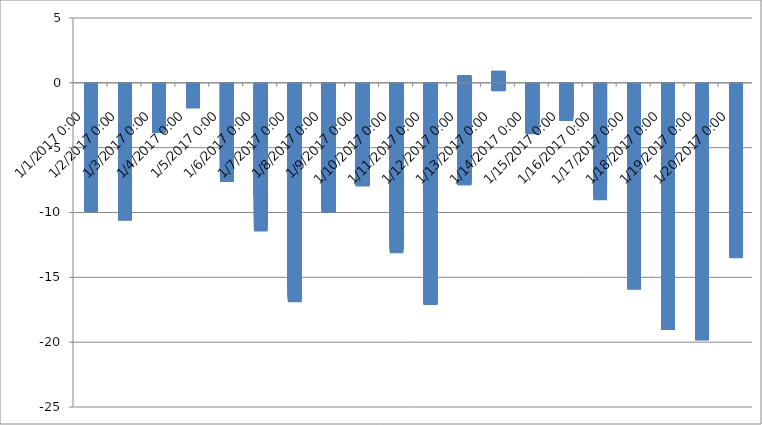
| Category | Series 0 |
|---|---|
| 2017-01-20 14:05:00 | -2.94 |
| 2017-01-20 13:55:00 | -3.04 |
| 2017-01-20 13:45:00 | -3.27 |
| 2017-01-20 13:35:01 | -3.48 |
| 2017-01-20 13:25:00 | -3.65 |
| 2017-01-20 13:15:00 | -3.69 |
| 2017-01-20 13:05:00 | -3.88 |
| 2017-01-20 12:55:01 | -4.12 |
| 2017-01-20 12:45:00 | -4.33 |
| 2017-01-20 12:35:00 | -4.58 |
| 2017-01-20 12:25:00 | -4.79 |
| 2017-01-20 12:15:00 | -4.99 |
| 2017-01-20 12:05:00 | -5.22 |
| 2017-01-20 11:55:00 | -5.56 |
| 2017-01-20 11:45:00 | -5.78 |
| 2017-01-20 11:35:00 | -6.12 |
| 2017-01-20 11:25:01 | -6.4 |
| 2017-01-20 11:15:00 | -6.59 |
| 2017-01-20 11:05:00 | -6.93 |
| 2017-01-20 10:55:00 | -7.17 |
| 2017-01-20 10:45:01 | -7.41 |
| 2017-01-20 10:35:00 | -7.7 |
| 2017-01-20 10:25:00 | -7.82 |
| 2017-01-20 10:15:00 | -8.14 |
| 2017-01-20 10:05:00 | -8.28 |
| 2017-01-20 09:55:00 | -8.5 |
| 2017-01-20 09:45:00 | -8.76 |
| 2017-01-20 09:35:00 | -9.01 |
| 2017-01-20 09:25:00 | -9.4 |
| 2017-01-20 09:15:01 | -9.62 |
| 2017-01-20 09:05:00 | -9.91 |
| 2017-01-20 08:55:00 | -10.06 |
| 2017-01-20 08:45:00 | -10.09 |
| 2017-01-20 08:35:01 | -10.04 |
| 2017-01-20 08:25:00 | -9.92 |
| 2017-01-20 08:15:00 | -9.8 |
| 2017-01-20 08:05:00 | -9.81 |
| 2017-01-20 07:55:01 | -9.72 |
| 2017-01-20 07:45:00 | -9.74 |
| 2017-01-20 07:35:00 | -9.77 |
| 2017-01-20 07:25:00 | -9.8 |
| 2017-01-20 07:15:00 | -9.9 |
| 2017-01-20 07:05:01 | -9.96 |
| 2017-01-20 06:55:00 | -10.05 |
| 2017-01-20 06:45:00 | -10.08 |
| 2017-01-20 06:35:00 | -10.11 |
| 2017-01-20 06:25:01 | -10.19 |
| 2017-01-20 06:14:54 | -10.23 |
| 2017-01-20 06:04:54 | -10.38 |
| 2017-01-20 05:54:54 | -10.46 |
| 2017-01-20 05:44:55 | -10.52 |
| 2017-01-20 05:34:54 | -10.51 |
| 2017-01-20 05:24:54 | -10.59 |
| 2017-01-20 05:14:54 | -10.68 |
| 2017-01-20 05:04:54 | -10.69 |
| 2017-01-20 04:54:55 | -10.65 |
| 2017-01-20 04:44:54 | -10.82 |
| 2017-01-20 04:34:54 | -10.87 |
| 2017-01-20 04:24:54 | -10.97 |
| 2017-01-20 04:14:55 | -10.95 |
| 2017-01-20 04:04:54 | -11.1 |
| 2017-01-20 03:54:54 | -11.17 |
| 2017-01-20 03:44:54 | -11.18 |
| 2017-01-20 03:34:55 | -11.25 |
| 2017-01-20 03:24:54 | -11.35 |
| 2017-01-20 03:14:54 | -11.46 |
| 2017-01-20 03:04:54 | -11.49 |
| 2017-01-20 02:54:54 | -11.56 |
| 2017-01-20 02:44:55 | -11.66 |
| 2017-01-20 02:34:54 | -11.84 |
| 2017-01-20 02:24:54 | -11.9 |
| 2017-01-20 02:14:54 | -12.01 |
| 2017-01-20 02:04:55 | -12.11 |
| 2017-01-20 01:54:54 | -12.16 |
| 2017-01-20 01:44:54 | -12.28 |
| 2017-01-20 01:34:54 | -12.38 |
| 2017-01-20 01:24:55 | -12.56 |
| 2017-01-20 01:14:54 | -12.67 |
| 2017-01-20 01:04:54 | -12.79 |
| 2017-01-20 00:54:54 | -12.9 |
| 2017-01-20 00:44:54 | -12.94 |
| 2017-01-20 00:34:55 | -13.11 |
| 2017-01-20 00:24:54 | -13.19 |
| 2017-01-20 00:14:54 | -13.31 |
| 2017-01-20 00:04:54 | -13.46 |
| 2017-01-19 23:54:55 | -13.53 |
| 2017-01-19 23:44:54 | -13.71 |
| 2017-01-19 23:34:54 | -13.94 |
| 2017-01-19 23:24:54 | -14.14 |
| 2017-01-19 23:14:55 | -14.26 |
| 2017-01-19 23:04:54 | -14.4 |
| 2017-01-19 22:54:54 | -14.51 |
| 2017-01-19 22:44:54 | -14.63 |
| 2017-01-19 22:34:54 | -14.73 |
| 2017-01-19 22:24:55 | -14.83 |
| 2017-01-19 22:14:54 | -14.9 |
| 2017-01-19 22:04:54 | -14.98 |
| 2017-01-19 21:54:54 | -14.99 |
| 2017-01-19 21:44:55 | -14.93 |
| 2017-01-19 21:34:54 | -14.87 |
| 2017-01-19 21:24:54 | -14.83 |
| 2017-01-19 21:14:54 | -14.72 |
| 2017-01-19 21:04:54 | -14.68 |
| 2017-01-19 20:54:54 | -14.64 |
| 2017-01-19 20:44:54 | -14.53 |
| 2017-01-19 20:34:54 | -14.51 |
| 2017-01-19 20:24:54 | -14.4 |
| 2017-01-19 20:14:55 | -14.43 |
| 2017-01-19 20:04:54 | -14.37 |
| 2017-01-19 19:54:54 | -14.26 |
| 2017-01-19 19:44:54 | -14.26 |
| 2017-01-19 19:34:55 | -14.22 |
| 2017-01-19 19:24:54 | -14.13 |
| 2017-01-19 19:14:54 | -14.03 |
| 2017-01-19 19:04:54 | -13.9 |
| 2017-01-19 18:54:54 | -13.92 |
| 2017-01-19 18:44:55 | -13.92 |
| 2017-01-19 18:34:54 | -13.83 |
| 2017-01-19 18:24:54 | -13.71 |
| 2017-01-19 18:14:54 | -13.71 |
| 2017-01-19 18:04:55 | -13.61 |
| 2017-01-19 17:54:54 | -13.65 |
| 2017-01-19 17:44:54 | -13.54 |
| 2017-01-19 17:34:54 | -13.45 |
| 2017-01-19 17:24:55 | -13.4 |
| 2017-01-19 17:14:54 | -13.41 |
| 2017-01-19 17:04:54 | -13.33 |
| 2017-01-19 16:54:54 | -13.37 |
| 2017-01-19 16:44:54 | -13.23 |
| 2017-01-19 16:34:55 | -13.23 |
| 2017-01-19 16:24:54 | -13.18 |
| 2017-01-19 16:14:54 | -13.15 |
| 2017-01-19 16:04:54 | -13.12 |
| 2017-01-19 15:54:55 | -13.04 |
| 2017-01-19 15:44:54 | -13.04 |
| 2017-01-19 15:34:54 | -12.97 |
| 2017-01-19 15:24:54 | -13.06 |
| 2017-01-19 15:14:55 | -12.94 |
| 2017-01-19 15:04:54 | -12.97 |
| 2017-01-19 14:54:54 | -13.01 |
| 2017-01-19 14:44:54 | -13.04 |
| 2017-01-19 14:34:54 | -13.08 |
| 2017-01-19 14:24:55 | -13.17 |
| 2017-01-19 14:14:54 | -13.37 |
| 2017-01-19 14:04:54 | -13.54 |
| 2017-01-19 13:54:54 | -13.76 |
| 2017-01-19 13:44:55 | -13.95 |
| 2017-01-19 13:34:54 | -14.14 |
| 2017-01-19 13:24:54 | -14.29 |
| 2017-01-19 13:14:54 | -14.58 |
| 2017-01-19 13:04:55 | -14.83 |
| 2017-01-19 12:54:54 | -15.09 |
| 2017-01-19 12:44:54 | -15.29 |
| 2017-01-19 12:34:54 | -15.54 |
| 2017-01-19 12:24:54 | -15.81 |
| 2017-01-19 12:14:55 | -16.02 |
| 2017-01-19 12:04:54 | -16.37 |
| 2017-01-19 11:54:54 | -16.72 |
| 2017-01-19 11:44:54 | -16.97 |
| 2017-01-19 11:34:55 | -17.33 |
| 2017-01-19 11:24:54 | -17.6 |
| 2017-01-19 11:14:54 | -17.82 |
| 2017-01-19 11:04:54 | -18.08 |
| 2017-01-19 10:54:54 | -18.21 |
| 2017-01-19 10:44:54 | -18.42 |
| 2017-01-19 10:34:54 | -18.66 |
| 2017-01-19 10:24:54 | -18.86 |
| 2017-01-19 10:14:54 | -19.08 |
| 2017-01-19 10:04:55 | -19.24 |
| 2017-01-19 09:54:54 | -19.27 |
| 2017-01-19 09:44:54 | -19.39 |
| 2017-01-19 09:34:54 | -19.47 |
| 2017-01-19 09:24:55 | -19.56 |
| 2017-01-19 09:14:54 | -19.58 |
| 2017-01-19 09:04:54 | -19.7 |
| 2017-01-19 08:54:54 | -19.76 |
| 2017-01-19 08:44:54 | -19.77 |
| 2017-01-19 08:34:55 | -19.75 |
| 2017-01-19 08:24:54 | -19.73 |
| 2017-01-19 08:14:54 | -19.78 |
| 2017-01-19 08:04:54 | -19.78 |
| 2017-01-19 07:54:55 | -19.63 |
| 2017-01-19 07:44:54 | -19.69 |
| 2017-01-19 07:34:54 | -19.6 |
| 2017-01-19 07:24:54 | -19.56 |
| 2017-01-19 07:14:55 | -19.56 |
| 2017-01-19 07:04:54 | -19.45 |
| 2017-01-19 06:54:54 | -19.4 |
| 2017-01-19 06:44:54 | -19.31 |
| 2017-01-19 06:34:54 | -19.21 |
| 2017-01-19 06:24:55 | -19.25 |
| 2017-01-19 06:14:54 | -19.24 |
| 2017-01-19 06:04:54 | -19.21 |
| 2017-01-19 05:54:54 | -19.07 |
| 2017-01-19 05:44:55 | -19.1 |
| 2017-01-19 05:34:54 | -19.07 |
| 2017-01-19 05:24:54 | -18.93 |
| 2017-01-19 05:14:54 | -18.91 |
| 2017-01-19 05:04:55 | -18.86 |
| 2017-01-19 04:54:49 | -18.83 |
| 2017-01-19 04:44:49 | -18.76 |
| 2017-01-19 04:34:49 | -18.69 |
| 2017-01-19 04:24:49 | -18.59 |
| 2017-01-19 04:14:50 | -18.56 |
| 2017-01-19 04:04:49 | -18.5 |
| 2017-01-19 03:54:49 | -18.45 |
| 2017-01-19 03:44:49 | -18.41 |
| 2017-01-19 03:34:50 | -18.4 |
| 2017-01-19 03:24:49 | -18.29 |
| 2017-01-19 03:14:49 | -18.19 |
| 2017-01-19 03:04:49 | -18.14 |
| 2017-01-19 02:54:50 | -18.04 |
| 2017-01-19 02:44:49 | -17.98 |
| 2017-01-19 02:34:49 | -17.93 |
| 2017-01-19 02:24:49 | -17.9 |
| 2017-01-19 02:14:49 | -17.84 |
| 2017-01-19 02:04:50 | -17.71 |
| 2017-01-19 01:54:49 | -17.67 |
| 2017-01-19 01:44:49 | -17.55 |
| 2017-01-19 01:34:49 | -17.46 |
| 2017-01-19 01:24:50 | -17.46 |
| 2017-01-19 01:14:49 | -17.31 |
| 2017-01-19 01:04:49 | -17.31 |
| 2017-01-19 00:54:49 | -17.26 |
| 2017-01-19 00:44:50 | -17.1 |
| 2017-01-19 00:34:49 | -17.06 |
| 2017-01-19 00:24:49 | -16.97 |
| 2017-01-19 00:14:49 | -16.89 |
| 2017-01-19 00:04:49 | -16.79 |
| 2017-01-18 23:54:49 | -16.79 |
| 2017-01-18 23:44:49 | -16.65 |
| 2017-01-18 23:34:49 | -16.58 |
| 2017-01-18 23:24:49 | -16.52 |
| 2017-01-18 23:14:50 | -16.4 |
| 2017-01-18 23:04:49 | -16.36 |
| 2017-01-18 22:54:49 | -16.31 |
| 2017-01-18 22:44:49 | -16.19 |
| 2017-01-18 22:34:50 | -16.14 |
| 2017-01-18 22:24:49 | -16.15 |
| 2017-01-18 22:14:49 | -16.04 |
| 2017-01-18 22:04:49 | -16.01 |
| 2017-01-18 21:54:49 | -15.87 |
| 2017-01-18 21:44:50 | -15.83 |
| 2017-01-18 21:34:49 | -15.66 |
| 2017-01-18 21:24:49 | -15.55 |
| 2017-01-18 21:14:49 | -15.51 |
| 2017-01-18 21:04:50 | -15.38 |
| 2017-01-18 20:54:49 | -15.31 |
| 2017-01-18 20:44:49 | -15.19 |
| 2017-01-18 20:34:49 | -15.18 |
| 2017-01-18 20:24:50 | -15.03 |
| 2017-01-18 20:14:49 | -14.97 |
| 2017-01-18 20:04:49 | -14.84 |
| 2017-01-18 19:54:49 | -14.83 |
| 2017-01-18 19:44:49 | -14.68 |
| 2017-01-18 19:34:50 | -14.64 |
| 2017-01-18 19:24:49 | -14.48 |
| 2017-01-18 19:14:49 | -14.33 |
| 2017-01-18 19:04:49 | -14.28 |
| 2017-01-18 18:54:50 | -14.16 |
| 2017-01-18 18:44:49 | -14.09 |
| 2017-01-18 18:34:49 | -13.96 |
| 2017-01-18 18:24:49 | -13.83 |
| 2017-01-18 18:14:50 | -13.79 |
| 2017-01-18 18:04:49 | -13.77 |
| 2017-01-18 17:54:49 | -13.63 |
| 2017-01-18 17:44:49 | -13.59 |
| 2017-01-18 17:34:49 | -13.52 |
| 2017-01-18 17:24:50 | -13.37 |
| 2017-01-18 17:14:49 | -13.21 |
| 2017-01-18 17:04:49 | -13.21 |
| 2017-01-18 16:54:49 | -13.05 |
| 2017-01-18 16:44:50 | -13.04 |
| 2017-01-18 16:34:49 | -12.97 |
| 2017-01-18 16:24:49 | -12.93 |
| 2017-01-18 16:14:49 | -12.81 |
| 2017-01-18 16:04:49 | -12.74 |
| 2017-01-18 15:54:50 | -12.67 |
| 2017-01-18 15:44:49 | -12.53 |
| 2017-01-18 15:34:49 | -12.55 |
| 2017-01-18 15:24:49 | -12.46 |
| 2017-01-18 15:14:50 | -12.41 |
| 2017-01-18 15:04:49 | -12.41 |
| 2017-01-18 14:54:49 | -12.26 |
| 2017-01-18 14:44:49 | -12.29 |
| 2017-01-18 14:34:50 | -12.3 |
| 2017-01-18 14:24:49 | -12.28 |
| 2017-01-18 14:14:49 | -12.46 |
| 2017-01-18 14:04:49 | -12.64 |
| 2017-01-18 13:54:49 | -12.77 |
| 2017-01-18 13:44:50 | -13.03 |
| 2017-01-18 13:34:49 | -13.22 |
| 2017-01-18 13:24:49 | -13.45 |
| 2017-01-18 13:14:49 | -13.67 |
| 2017-01-18 13:04:50 | -13.94 |
| 2017-01-18 12:54:49 | -14.1 |
| 2017-01-18 12:44:49 | -14.41 |
| 2017-01-18 12:34:49 | -14.68 |
| 2017-01-18 12:24:50 | -14.98 |
| 2017-01-18 12:14:49 | -15.23 |
| 2017-01-18 12:04:49 | -15.59 |
| 2017-01-18 11:54:49 | -15.98 |
| 2017-01-18 11:44:49 | -16.17 |
| 2017-01-18 11:34:50 | -16.48 |
| 2017-01-18 11:24:49 | -16.76 |
| 2017-01-18 11:14:49 | -17.02 |
| 2017-01-18 11:04:49 | -17.29 |
| 2017-01-18 10:54:50 | -17.47 |
| 2017-01-18 10:44:49 | -17.59 |
| 2017-01-18 10:34:49 | -17.79 |
| 2017-01-18 10:24:49 | -18.05 |
| 2017-01-18 10:14:50 | -18.21 |
| 2017-01-18 10:04:49 | -18.36 |
| 2017-01-18 09:54:49 | -18.54 |
| 2017-01-18 09:44:49 | -18.74 |
| 2017-01-18 09:34:49 | -18.83 |
| 2017-01-18 09:24:50 | -18.95 |
| 2017-01-18 09:14:49 | -18.99 |
| 2017-01-18 09:04:49 | -18.98 |
| 2017-01-18 08:54:49 | -18.88 |
| 2017-01-18 08:44:50 | -18.88 |
| 2017-01-18 08:34:49 | -18.86 |
| 2017-01-18 08:24:49 | -18.96 |
| 2017-01-18 08:14:49 | -18.8 |
| 2017-01-18 08:04:49 | -18.88 |
| 2017-01-18 07:54:49 | -18.78 |
| 2017-01-18 07:44:49 | -18.74 |
| 2017-01-18 07:34:49 | -18.67 |
| 2017-01-18 07:24:49 | -18.56 |
| 2017-01-18 07:14:50 | -18.48 |
| 2017-01-18 07:04:49 | -18.4 |
| 2017-01-18 06:54:49 | -18.34 |
| 2017-01-18 06:44:49 | -18.23 |
| 2017-01-18 06:34:50 | -18.25 |
| 2017-01-18 06:24:49 | -18.14 |
| 2017-01-18 06:14:49 | -18.13 |
| 2017-01-18 06:04:49 | -17.98 |
| 2017-01-18 05:54:49 | -18.06 |
| 2017-01-18 05:44:50 | -17.95 |
| 2017-01-18 05:34:49 | -17.95 |
| 2017-01-18 05:24:49 | -17.85 |
| 2017-01-18 05:14:49 | -17.73 |
| 2017-01-18 05:04:50 | -17.71 |
| 2017-01-18 04:54:49 | -17.67 |
| 2017-01-18 04:44:49 | -17.51 |
| 2017-01-18 04:34:49 | -17.43 |
| 2017-01-18 04:24:50 | -17.41 |
| 2017-01-18 04:14:49 | -17.36 |
| 2017-01-18 04:04:49 | -17.32 |
| 2017-01-18 03:54:49 | -17.26 |
| 2017-01-18 03:44:49 | -17.21 |
| 2017-01-18 03:34:50 | -17.15 |
| 2017-01-18 03:24:49 | -17.11 |
| 2017-01-18 03:14:49 | -17.03 |
| 2017-01-18 03:04:49 | -16.91 |
| 2017-01-18 02:54:50 | -16.82 |
| 2017-01-18 02:44:49 | -16.73 |
| 2017-01-18 02:34:49 | -16.6 |
| 2017-01-18 02:24:49 | -16.58 |
| 2017-01-18 02:14:50 | -16.43 |
| 2017-01-18 02:04:49 | -16.4 |
| 2017-01-18 01:54:49 | -16.34 |
| 2017-01-18 01:44:49 | -16.18 |
| 2017-01-18 01:34:49 | -16.11 |
| 2017-01-18 01:24:50 | -16.15 |
| 2017-01-18 01:14:49 | -15.96 |
| 2017-01-18 01:04:49 | -15.82 |
| 2017-01-18 00:54:49 | -15.74 |
| 2017-01-18 00:44:50 | -15.61 |
| 2017-01-18 00:34:49 | -15.44 |
| 2017-01-18 00:24:49 | -15.34 |
| 2017-01-18 00:14:49 | -15.29 |
| 2017-01-18 00:04:50 | -15.16 |
| 2017-01-17 23:54:49 | -15.17 |
| 2017-01-17 23:44:49 | -15.09 |
| 2017-01-17 23:34:49 | -14.99 |
| 2017-01-17 23:24:49 | -14.87 |
| 2017-01-17 23:14:50 | -14.75 |
| 2017-01-17 23:04:49 | -14.6 |
| 2017-01-17 22:54:49 | -14.57 |
| 2017-01-17 22:44:49 | -14.44 |
| 2017-01-17 22:34:50 | -14.23 |
| 2017-01-17 22:24:49 | -14.16 |
| 2017-01-17 22:14:49 | -14.03 |
| 2017-01-17 22:04:41 | -13.94 |
| 2017-01-17 21:54:42 | -13.91 |
| 2017-01-17 21:44:41 | -13.79 |
| 2017-01-17 21:34:41 | -13.76 |
| 2017-01-17 21:24:41 | -13.69 |
| 2017-01-17 21:14:41 | -13.66 |
| 2017-01-17 21:04:42 | -13.53 |
| 2017-01-17 20:54:41 | -13.4 |
| 2017-01-17 20:44:41 | -13.29 |
| 2017-01-17 20:34:41 | -13.17 |
| 2017-01-17 20:24:42 | -13.06 |
| 2017-01-17 20:14:41 | -12.89 |
| 2017-01-17 20:04:41 | -12.86 |
| 2017-01-17 19:54:41 | -12.67 |
| 2017-01-17 19:44:42 | -12.58 |
| 2017-01-17 19:34:41 | -12.52 |
| 2017-01-17 19:24:41 | -12.34 |
| 2017-01-17 19:14:41 | -12.21 |
| 2017-01-17 19:04:41 | -12.11 |
| 2017-01-17 18:54:42 | -11.99 |
| 2017-01-17 18:44:41 | -11.92 |
| 2017-01-17 18:34:41 | -11.85 |
| 2017-01-17 18:24:41 | -11.66 |
| 2017-01-17 18:14:42 | -11.58 |
| 2017-01-17 18:04:41 | -11.55 |
| 2017-01-17 17:54:41 | -11.31 |
| 2017-01-17 17:44:41 | -11.26 |
| 2017-01-17 17:34:42 | -11.16 |
| 2017-01-17 17:24:41 | -11.1 |
| 2017-01-17 17:14:41 | -10.99 |
| 2017-01-17 17:04:41 | -10.9 |
| 2017-01-17 16:54:41 | -10.81 |
| 2017-01-17 16:44:42 | -10.87 |
| 2017-01-17 16:34:41 | -10.86 |
| 2017-01-17 16:24:41 | -10.83 |
| 2017-01-17 16:14:41 | -10.72 |
| 2017-01-17 16:04:42 | -10.63 |
| 2017-01-17 15:54:41 | -10.59 |
| 2017-01-17 15:44:41 | -10.65 |
| 2017-01-17 15:34:41 | -10.61 |
| 2017-01-17 15:24:42 | -10.55 |
| 2017-01-17 15:14:41 | -10.55 |
| 2017-01-17 15:04:41 | -10.55 |
| 2017-01-17 14:54:41 | -10.59 |
| 2017-01-17 14:44:41 | -10.49 |
| 2017-01-17 14:34:42 | -10.56 |
| 2017-01-17 14:24:41 | -10.63 |
| 2017-01-17 14:14:41 | -10.83 |
| 2017-01-17 14:04:41 | -10.96 |
| 2017-01-17 13:54:42 | -11.18 |
| 2017-01-17 13:44:41 | -11.34 |
| 2017-01-17 13:34:41 | -11.55 |
| 2017-01-17 13:24:41 | -11.63 |
| 2017-01-17 13:14:42 | -11.84 |
| 2017-01-17 13:04:41 | -12.04 |
| 2017-01-17 12:54:41 | -12.26 |
| 2017-01-17 12:44:41 | -12.37 |
| 2017-01-17 12:34:41 | -12.71 |
| 2017-01-17 12:24:42 | -12.93 |
| 2017-01-17 12:14:41 | -13.2 |
| 2017-01-17 12:04:41 | -13.51 |
| 2017-01-17 11:54:41 | -13.75 |
| 2017-01-17 11:44:42 | -14.06 |
| 2017-01-17 11:34:41 | -14.29 |
| 2017-01-17 11:24:41 | -14.59 |
| 2017-01-17 11:14:41 | -14.72 |
| 2017-01-17 11:04:42 | -14.89 |
| 2017-01-17 10:54:41 | -15.11 |
| 2017-01-17 10:44:41 | -15.3 |
| 2017-01-17 10:34:41 | -15.43 |
| 2017-01-17 10:24:41 | -15.51 |
| 2017-01-17 10:14:42 | -15.69 |
| 2017-01-17 10:04:41 | -15.78 |
| 2017-01-17 09:54:41 | -15.82 |
| 2017-01-17 09:44:41 | -15.87 |
| 2017-01-17 09:34:42 | -15.86 |
| 2017-01-17 09:24:41 | -15.85 |
| 2017-01-17 09:14:41 | -15.73 |
| 2017-01-17 09:04:41 | -15.27 |
| 2017-01-17 08:54:42 | -14.8 |
| 2017-01-17 08:44:41 | -15.06 |
| 2017-01-17 08:34:41 | -14.9 |
| 2017-01-17 08:24:41 | -14.67 |
| 2017-01-17 08:14:41 | -14.63 |
| 2017-01-17 08:04:42 | -14.66 |
| 2017-01-17 07:54:41 | -14.49 |
| 2017-01-17 07:44:41 | -14.54 |
| 2017-01-17 07:34:41 | -14.33 |
| 2017-01-17 07:24:42 | -14.09 |
| 2017-01-17 07:14:41 | -13.99 |
| 2017-01-17 07:04:41 | -13.93 |
| 2017-01-17 06:54:41 | -13.86 |
| 2017-01-17 06:44:42 | -13.66 |
| 2017-01-17 06:34:41 | -13.45 |
| 2017-01-17 06:24:41 | -13.53 |
| 2017-01-17 06:14:41 | -13.39 |
| 2017-01-17 06:04:41 | -13.24 |
| 2017-01-17 05:54:42 | -13.07 |
| 2017-01-17 05:44:41 | -12.89 |
| 2017-01-17 05:34:41 | -12.92 |
| 2017-01-17 05:24:41 | -12.76 |
| 2017-01-17 05:14:42 | -12.41 |
| 2017-01-17 05:04:41 | -12.4 |
| 2017-01-17 04:54:41 | -12.4 |
| 2017-01-17 04:44:41 | -12.29 |
| 2017-01-17 04:34:41 | -12.21 |
| 2017-01-17 04:24:41 | -11.99 |
| 2017-01-17 04:14:41 | -11.91 |
| 2017-01-17 04:04:41 | -11.74 |
| 2017-01-17 03:54:41 | -11.73 |
| 2017-01-17 03:44:42 | -11.68 |
| 2017-01-17 03:34:41 | -11.46 |
| 2017-01-17 03:24:41 | -11.31 |
| 2017-01-17 03:14:41 | -11.2 |
| 2017-01-17 03:04:42 | -11.13 |
| 2017-01-17 02:54:41 | -10.97 |
| 2017-01-17 02:44:41 | -10.82 |
| 2017-01-17 02:34:41 | -10.73 |
| 2017-01-17 02:24:42 | -10.58 |
| 2017-01-17 02:14:41 | -10.49 |
| 2017-01-17 02:04:41 | -10.48 |
| 2017-01-17 01:54:41 | -10.21 |
| 2017-01-17 01:44:41 | -10.14 |
| 2017-01-17 01:34:42 | -9.96 |
| 2017-01-17 01:24:41 | -9.87 |
| 2017-01-17 01:14:41 | -9.84 |
| 2017-01-17 01:04:41 | -9.64 |
| 2017-01-17 00:54:42 | -9.6 |
| 2017-01-17 00:44:41 | -9.52 |
| 2017-01-17 00:34:41 | -9.48 |
| 2017-01-17 00:24:41 | -9.34 |
| 2017-01-17 00:14:41 | -9.15 |
| 2017-01-17 00:04:41 | -9.09 |
| 2017-01-16 23:54:41 | -8.97 |
| 2017-01-16 23:44:41 | -8.87 |
| 2017-01-16 23:34:41 | -8.73 |
| 2017-01-16 23:24:42 | -8.64 |
| 2017-01-16 23:14:41 | -8.51 |
| 2017-01-16 23:04:41 | -8.38 |
| 2017-01-16 22:54:41 | -8.26 |
| 2017-01-16 22:44:42 | -8.14 |
| 2017-01-16 22:34:41 | -8.05 |
| 2017-01-16 22:24:41 | -7.78 |
| 2017-01-16 22:14:41 | -7.63 |
| 2017-01-16 22:04:41 | -7.5 |
| 2017-01-16 21:54:42 | -7.33 |
| 2017-01-16 21:44:41 | -7.06 |
| 2017-01-16 21:34:41 | -6.79 |
| 2017-01-16 21:24:41 | -6.54 |
| 2017-01-16 21:14:42 | -6.35 |
| 2017-01-16 21:04:41 | -6.14 |
| 2017-01-16 20:54:41 | -5.8 |
| 2017-01-16 20:44:41 | -5.61 |
| 2017-01-16 20:34:42 | -5.3 |
| 2017-01-16 20:24:41 | -5.1 |
| 2017-01-16 20:14:41 | -5.01 |
| 2017-01-16 20:04:41 | -4.86 |
| 2017-01-16 19:54:41 | -4.62 |
| 2017-01-16 19:44:42 | -4.49 |
| 2017-01-16 19:34:41 | -4.02 |
| 2017-01-16 19:24:41 | -3.77 |
| 2017-01-16 19:14:41 | -3.6 |
| 2017-01-16 19:04:42 | -3.54 |
| 2017-01-16 18:54:41 | -3.4 |
| 2017-01-16 18:44:41 | -3.15 |
| 2017-01-16 18:34:41 | -2.95 |
| 2017-01-16 18:24:42 | -2.84 |
| 2017-01-16 18:14:41 | -2.74 |
| 2017-01-16 18:04:42 | -2.65 |
| 2017-01-16 17:54:42 | -2.53 |
| 2017-01-16 17:44:42 | -2.43 |
| 2017-01-16 17:34:43 | -2.28 |
| 2017-01-16 17:24:42 | -2.12 |
| 2017-01-16 17:14:42 | -2.16 |
| 2017-01-16 17:04:42 | -2.11 |
| 2017-01-16 16:54:43 | -2.03 |
| 2017-01-16 16:44:42 | -1.87 |
| 2017-01-16 16:34:42 | -1.86 |
| 2017-01-16 16:24:42 | -1.65 |
| 2017-01-16 16:14:42 | -1.63 |
| 2017-01-16 16:04:42 | -1.43 |
| 2017-01-16 15:54:42 | -1.36 |
| 2017-01-16 15:44:42 | -1.29 |
| 2017-01-16 15:34:42 | -1.25 |
| 2017-01-16 15:24:43 | -1.13 |
| 2017-01-16 15:14:42 | -1.1 |
| 2017-01-16 15:04:42 | -1.09 |
| 2017-01-16 14:54:42 | -1.19 |
| 2017-01-16 14:44:43 | -1.09 |
| 2017-01-16 14:34:42 | -1.09 |
| 2017-01-16 14:24:42 | -1.09 |
| 2017-01-16 14:14:42 | -1.19 |
| 2017-01-16 14:04:43 | -1.21 |
| 2017-01-16 13:54:42 | -1.33 |
| 2017-01-16 13:44:42 | -1.41 |
| 2017-01-16 13:34:42 | -1.4 |
| 2017-01-16 13:24:42 | -1.53 |
| 2017-01-16 13:14:43 | -1.48 |
| 2017-01-16 13:04:42 | -1.44 |
| 2017-01-16 12:54:42 | -1.35 |
| 2017-01-16 12:44:42 | -1.36 |
| 2017-01-16 12:34:43 | -1.4 |
| 2017-01-16 12:24:42 | -1.58 |
| 2017-01-16 12:14:42 | -1.87 |
| 2017-01-16 12:04:42 | -2.21 |
| 2017-01-16 11:54:43 | -2.34 |
| 2017-01-16 11:44:42 | -2.43 |
| 2017-01-16 11:34:42 | -2.7 |
| 2017-01-16 11:24:42 | -2.81 |
| 2017-01-16 11:14:42 | -2.88 |
| 2017-01-16 11:04:43 | -3.05 |
| 2017-01-16 10:54:42 | -3.14 |
| 2017-01-16 10:44:42 | -3.09 |
| 2017-01-16 10:34:42 | -3.23 |
| 2017-01-16 10:24:43 | -3.4 |
| 2017-01-16 10:14:42 | -3.56 |
| 2017-01-16 10:04:42 | -3.7 |
| 2017-01-16 09:54:42 | -3.56 |
| 2017-01-16 09:44:42 | -3.64 |
| 2017-01-16 09:34:43 | -3.71 |
| 2017-01-16 09:24:42 | -3.83 |
| 2017-01-16 09:14:42 | -3.98 |
| 2017-01-16 09:04:42 | -3.89 |
| 2017-01-16 08:54:43 | -4.04 |
| 2017-01-16 08:44:42 | -4.12 |
| 2017-01-16 08:34:42 | -4.25 |
| 2017-01-16 08:24:42 | -4.28 |
| 2017-01-16 08:14:43 | -4.3 |
| 2017-01-16 08:04:42 | -4.33 |
| 2017-01-16 07:54:42 | -4.37 |
| 2017-01-16 07:44:42 | -4.51 |
| 2017-01-16 07:34:42 | -4.44 |
| 2017-01-16 07:24:42 | -4.6 |
| 2017-01-16 07:14:42 | -4.56 |
| 2017-01-16 07:04:42 | -4.57 |
| 2017-01-16 06:54:42 | -4.51 |
| 2017-01-16 06:44:43 | -4.45 |
| 2017-01-16 06:34:42 | -4.42 |
| 2017-01-16 06:24:42 | -4.58 |
| 2017-01-16 06:14:42 | -4.58 |
| 2017-01-16 06:04:43 | -4.66 |
| 2017-01-16 05:54:42 | -4.46 |
| 2017-01-16 05:44:42 | -4.19 |
| 2017-01-16 05:34:42 | -3.94 |
| 2017-01-16 05:24:43 | -3.68 |
| 2017-01-16 05:14:42 | -3.46 |
| 2017-01-16 05:04:42 | -3.32 |
| 2017-01-16 04:54:42 | -3.24 |
| 2017-01-16 04:44:42 | -3.2 |
| 2017-01-16 04:34:43 | -3.18 |
| 2017-01-16 04:24:42 | -3.1 |
| 2017-01-16 04:14:42 | -3.09 |
| 2017-01-16 04:04:42 | -3.08 |
| 2017-01-16 03:54:43 | -3.08 |
| 2017-01-16 03:44:42 | -3.09 |
| 2017-01-16 03:34:42 | -3.11 |
| 2017-01-16 03:24:42 | -3.09 |
| 2017-01-16 03:14:42 | -3.14 |
| 2017-01-16 03:04:43 | -3.19 |
| 2017-01-16 02:54:42 | -3.21 |
| 2017-01-16 02:44:42 | -3.13 |
| 2017-01-16 02:34:42 | -3.11 |
| 2017-01-16 02:24:43 | -2.98 |
| 2017-01-16 02:14:42 | -3.08 |
| 2017-01-16 02:04:42 | -2.94 |
| 2017-01-16 01:54:42 | -3.05 |
| 2017-01-16 01:44:43 | -3.13 |
| 2017-01-16 01:34:42 | -3.01 |
| 2017-01-16 01:24:42 | -2.96 |
| 2017-01-16 01:14:42 | -2.84 |
| 2017-01-16 01:04:42 | -2.94 |
| 2017-01-16 00:54:43 | -2.84 |
| 2017-01-16 00:44:42 | -2.86 |
| 2017-01-16 00:34:42 | -2.89 |
| 2017-01-16 00:24:42 | -2.86 |
| 2017-01-16 00:14:43 | -2.9 |
| 2017-01-16 00:04:42 | -2.83 |
| 2017-01-15 23:54:42 | -2.84 |
| 2017-01-15 23:44:42 | -2.82 |
| 2017-01-15 23:34:43 | -2.77 |
| 2017-01-15 23:24:42 | -2.85 |
| 2017-01-15 23:14:42 | -2.83 |
| 2017-01-15 23:04:42 | -2.82 |
| 2017-01-15 22:54:42 | -2.79 |
| 2017-01-15 22:44:43 | -2.72 |
| 2017-01-15 22:34:42 | -2.72 |
| 2017-01-15 22:24:42 | -2.67 |
| 2017-01-15 22:14:42 | -2.65 |
| 2017-01-15 22:04:43 | -2.58 |
| 2017-01-15 21:54:42 | -2.57 |
| 2017-01-15 21:44:42 | -2.6 |
| 2017-01-15 21:34:42 | -2.64 |
| 2017-01-15 21:24:43 | -2.59 |
| 2017-01-15 21:14:42 | -2.56 |
| 2017-01-15 21:04:42 | -2.51 |
| 2017-01-15 20:54:42 | -2.49 |
| 2017-01-15 20:44:42 | -2.47 |
| 2017-01-15 20:34:43 | -2.45 |
| 2017-01-15 20:24:42 | -2.45 |
| 2017-01-15 20:14:42 | -2.44 |
| 2017-01-15 20:04:42 | -2.39 |
| 2017-01-15 19:54:43 | -2.41 |
| 2017-01-15 19:44:42 | -2.41 |
| 2017-01-15 19:34:42 | -2.36 |
| 2017-01-15 19:24:42 | -2.25 |
| 2017-01-15 19:14:43 | -2.28 |
| 2017-01-15 19:04:42 | -2.24 |
| 2017-01-15 18:54:42 | -2.29 |
| 2017-01-15 18:44:42 | -2.21 |
| 2017-01-15 18:34:42 | -2.13 |
| 2017-01-15 18:24:43 | -2.12 |
| 2017-01-15 18:14:42 | -2.15 |
| 2017-01-15 18:04:42 | -2.12 |
| 2017-01-15 17:54:42 | -2.09 |
| 2017-01-15 17:44:43 | -2.05 |
| 2017-01-15 17:34:42 | -2.08 |
| 2017-01-15 17:24:42 | -2.03 |
| 2017-01-15 17:14:42 | -2.01 |
| 2017-01-15 17:04:43 | -1.97 |
| 2017-01-15 16:54:42 | -1.95 |
| 2017-01-15 16:44:42 | -1.97 |
| 2017-01-15 16:34:42 | -1.86 |
| 2017-01-15 16:24:42 | -1.87 |
| 2017-01-15 16:14:42 | -1.77 |
| 2017-01-15 16:04:42 | -1.73 |
| 2017-01-15 15:54:42 | -1.72 |
| 2017-01-15 15:44:42 | -1.72 |
| 2017-01-15 15:34:43 | -1.72 |
| 2017-01-15 15:24:42 | -1.69 |
| 2017-01-15 15:14:42 | -1.62 |
| 2017-01-15 15:04:42 | -1.62 |
| 2017-01-15 14:54:43 | -1.69 |
| 2017-01-15 14:44:42 | -1.63 |
| 2017-01-15 14:34:42 | -1.66 |
| 2017-01-15 14:24:42 | -1.62 |
| 2017-01-15 14:14:43 | -1.48 |
| 2017-01-15 14:04:42 | -1.52 |
| 2017-01-15 13:54:42 | -1.48 |
| 2017-01-15 13:44:42 | -1.48 |
| 2017-01-15 13:34:42 | -1.42 |
| 2017-01-15 13:24:43 | -1.35 |
| 2017-01-15 13:14:42 | -1.32 |
| 2017-01-15 13:04:42 | -1.31 |
| 2017-01-15 12:54:42 | -1.23 |
| 2017-01-15 12:44:43 | -1.21 |
| 2017-01-15 12:34:42 | -1.18 |
| 2017-01-15 12:24:42 | -1.28 |
| 2017-01-15 12:14:42 | -1.28 |
| 2017-01-15 12:04:43 | -1.26 |
| 2017-01-15 11:54:42 | -1.33 |
| 2017-01-15 11:44:42 | -1.38 |
| 2017-01-15 11:34:42 | -1.54 |
| 2017-01-15 11:24:42 | -1.76 |
| 2017-01-15 11:14:43 | -1.81 |
| 2017-01-15 11:04:42 | -1.87 |
| 2017-01-15 10:54:42 | -1.83 |
| 2017-01-15 10:44:42 | -2.03 |
| 2017-01-15 10:34:43 | -1.93 |
| 2017-01-15 10:24:42 | -2.02 |
| 2017-01-15 10:14:42 | -1.95 |
| 2017-01-15 10:04:42 | -1.96 |
| 2017-01-15 09:54:43 | -2.05 |
| 2017-01-15 09:44:42 | -2.12 |
| 2017-01-15 09:34:42 | -2.16 |
| 2017-01-15 09:24:42 | -2.21 |
| 2017-01-15 09:14:42 | -2.23 |
| 2017-01-15 09:04:43 | -2.28 |
| 2017-01-15 08:54:42 | -2.35 |
| 2017-01-15 08:44:42 | -2.37 |
| 2017-01-15 08:34:42 | -2.4 |
| 2017-01-15 08:24:43 | -2.47 |
| 2017-01-15 08:14:42 | -2.41 |
| 2017-01-15 08:04:42 | -2.45 |
| 2017-01-15 07:54:42 | -2.42 |
| 2017-01-15 07:44:43 | -2.41 |
| 2017-01-15 07:34:42 | -2.36 |
| 2017-01-15 07:24:42 | -2.43 |
| 2017-01-15 07:14:42 | -2.32 |
| 2017-01-15 07:04:42 | -2.34 |
| 2017-01-15 06:54:43 | -2.28 |
| 2017-01-15 06:44:42 | -2.26 |
| 2017-01-15 06:34:42 | -2.24 |
| 2017-01-15 06:24:42 | -2.26 |
| 2017-01-15 06:14:43 | -2.26 |
| 2017-01-15 06:04:42 | -2.25 |
| 2017-01-15 05:54:42 | -2.21 |
| 2017-01-15 05:44:42 | -2.23 |
| 2017-01-15 05:34:43 | -2.26 |
| 2017-01-15 05:24:42 | -2.24 |
| 2017-01-15 05:14:42 | -2.29 |
| 2017-01-15 05:04:42 | -2.25 |
| 2017-01-15 04:54:42 | -2.25 |
| 2017-01-15 04:44:43 | -2.24 |
| 2017-01-15 04:34:42 | -2.27 |
| 2017-01-15 04:24:42 | -2.23 |
| 2017-01-15 04:14:42 | -2.24 |
| 2017-01-15 04:04:43 | -2.16 |
| 2017-01-15 03:54:42 | -2.24 |
| 2017-01-15 03:44:42 | -2.16 |
| 2017-01-15 03:34:42 | -2.12 |
| 2017-01-15 03:24:43 | -2.14 |
| 2017-01-15 03:14:42 | -2.18 |
| 2017-01-15 03:04:42 | -2.15 |
| 2017-01-15 02:54:42 | -2.1 |
| 2017-01-15 02:44:42 | -2.08 |
| 2017-01-15 02:34:43 | -2.08 |
| 2017-01-15 02:24:42 | -2.08 |
| 2017-01-15 02:14:42 | -2.12 |
| 2017-01-15 02:04:42 | -2.08 |
| 2017-01-15 01:54:43 | -2.07 |
| 2017-01-15 01:44:42 | -2.08 |
| 2017-01-15 01:34:42 | -2.03 |
| 2017-01-15 01:24:42 | -2.1 |
| 2017-01-15 01:14:42 | -1.98 |
| 2017-01-15 01:04:43 | -2.03 |
| 2017-01-15 00:54:42 | -2.03 |
| 2017-01-15 00:44:42 | -1.97 |
| 2017-01-15 00:34:42 | -1.97 |
| 2017-01-15 00:24:43 | -1.93 |
| 2017-01-15 00:14:42 | -1.94 |
| 2017-01-15 00:04:42 | -2.01 |
| 2017-01-14 23:54:42 | -1.93 |
| 2017-01-14 23:44:43 | -1.88 |
| 2017-01-14 23:34:42 | -1.93 |
| 2017-01-14 23:24:42 | -1.9 |
| 2017-01-14 23:14:42 | -1.91 |
| 2017-01-14 23:04:42 | -1.81 |
| 2017-01-14 22:54:43 | -1.81 |
| 2017-01-14 22:44:42 | -1.75 |
| 2017-01-14 22:34:42 | -1.69 |
| 2017-01-14 22:24:42 | -1.67 |
| 2017-01-14 22:14:43 | -1.67 |
| 2017-01-14 22:04:42 | -1.57 |
| 2017-01-14 21:54:42 | -1.65 |
| 2017-01-14 21:44:42 | -1.67 |
| 2017-01-14 21:34:43 | -1.71 |
| 2017-01-14 21:24:42 | -1.72 |
| 2017-01-14 21:14:42 | -1.64 |
| 2017-01-14 21:04:42 | -1.62 |
| 2017-01-14 20:54:42 | -1.62 |
| 2017-01-14 20:44:43 | -1.65 |
| 2017-01-14 20:34:42 | -1.64 |
| 2017-01-14 20:24:42 | -1.54 |
| 2017-01-14 20:14:42 | -1.51 |
| 2017-01-14 20:04:43 | -1.47 |
| 2017-01-14 19:54:42 | -1.43 |
| 2017-01-14 19:44:34 | -1.51 |
| 2017-01-14 19:34:34 | -1.52 |
| 2017-01-14 19:24:34 | -1.51 |
| 2017-01-14 19:14:35 | -1.51 |
| 2017-01-14 19:04:34 | -1.51 |
| 2017-01-14 18:54:34 | -1.53 |
| 2017-01-14 18:44:34 | -1.5 |
| 2017-01-14 18:34:35 | -1.47 |
| 2017-01-14 18:24:34 | -1.44 |
| 2017-01-14 18:14:34 | -1.41 |
| 2017-01-14 18:04:34 | -1.35 |
| 2017-01-14 17:54:35 | -1.4 |
| 2017-01-14 17:44:34 | -1.46 |
| 2017-01-14 17:34:34 | -1.47 |
| 2017-01-14 17:24:34 | -1.48 |
| 2017-01-14 17:14:34 | -1.49 |
| 2017-01-14 17:04:35 | -1.5 |
| 2017-01-14 16:54:34 | -1.42 |
| 2017-01-14 16:44:34 | -1.47 |
| 2017-01-14 16:34:34 | -1.47 |
| 2017-01-14 16:24:35 | -1.42 |
| 2017-01-14 16:14:34 | -1.44 |
| 2017-01-14 16:04:34 | -1.37 |
| 2017-01-14 15:54:34 | -1.4 |
| 2017-01-14 15:44:35 | -1.39 |
| 2017-01-14 15:34:34 | -1.39 |
| 2017-01-14 15:24:34 | -1.47 |
| 2017-01-14 15:14:34 | -1.37 |
| 2017-01-14 15:04:34 | -1.37 |
| 2017-01-14 14:54:35 | -1.31 |
| 2017-01-14 14:44:34 | -1.44 |
| 2017-01-14 14:34:34 | -1.4 |
| 2017-01-14 14:24:34 | -1.52 |
| 2017-01-14 14:14:35 | -1.55 |
| 2017-01-14 14:04:34 | -1.58 |
| 2017-01-14 13:54:34 | -1.62 |
| 2017-01-14 13:44:34 | -1.69 |
| 2017-01-14 13:34:35 | -1.73 |
| 2017-01-14 13:24:34 | -1.72 |
| 2017-01-14 13:14:34 | -1.68 |
| 2017-01-14 13:04:34 | -1.69 |
| 2017-01-14 12:54:34 | -1.72 |
| 2017-01-14 12:44:35 | -1.68 |
| 2017-01-14 12:34:34 | -1.79 |
| 2017-01-14 12:24:34 | -1.84 |
| 2017-01-14 12:14:34 | -1.93 |
| 2017-01-14 12:04:35 | -2.02 |
| 2017-01-14 11:54:34 | -2.06 |
| 2017-01-14 11:44:34 | -2.05 |
| 2017-01-14 11:34:34 | -2.16 |
| 2017-01-14 11:24:35 | -2.2 |
| 2017-01-14 11:14:34 | -2.31 |
| 2017-01-14 11:04:34 | -2.38 |
| 2017-01-14 10:54:34 | -2.38 |
| 2017-01-14 10:44:34 | -2.4 |
| 2017-01-14 10:34:34 | -2.45 |
| 2017-01-14 10:24:34 | -2.44 |
| 2017-01-14 10:14:34 | -2.55 |
| 2017-01-14 10:04:34 | -2.68 |
| 2017-01-14 09:54:35 | -2.64 |
| 2017-01-14 09:44:34 | -2.64 |
| 2017-01-14 09:34:34 | -2.72 |
| 2017-01-14 09:24:34 | -2.77 |
| 2017-01-14 09:14:35 | -2.77 |
| 2017-01-14 09:04:34 | -2.8 |
| 2017-01-14 08:54:34 | -2.87 |
| 2017-01-14 08:44:34 | -2.73 |
| 2017-01-14 08:34:34 | -2.83 |
| 2017-01-14 08:24:34 | -2.89 |
| 2017-01-14 08:14:34 | -2.92 |
| 2017-01-14 08:04:34 | -2.9 |
| 2017-01-14 07:54:34 | -2.99 |
| 2017-01-14 07:44:35 | -3.01 |
| 2017-01-14 07:34:34 | -3.02 |
| 2017-01-14 07:24:34 | -3.13 |
| 2017-01-14 07:14:34 | -3.18 |
| 2017-01-14 07:04:35 | -3.27 |
| 2017-01-14 06:54:34 | -3.47 |
| 2017-01-14 06:44:34 | -3.58 |
| 2017-01-14 06:34:34 | -3.76 |
| 2017-01-14 06:24:34 | -3.79 |
| 2017-01-14 06:14:35 | -3.89 |
| 2017-01-14 06:04:34 | -3.82 |
| 2017-01-14 05:54:34 | -3.53 |
| 2017-01-14 05:44:34 | -3.41 |
| 2017-01-14 05:34:35 | -3.05 |
| 2017-01-14 05:24:34 | -2.79 |
| 2017-01-14 05:14:34 | -2.49 |
| 2017-01-14 05:04:34 | -2.34 |
| 2017-01-14 04:54:35 | -2.32 |
| 2017-01-14 04:44:34 | -2.36 |
| 2017-01-14 04:34:34 | -2.26 |
| 2017-01-14 04:24:34 | -1.98 |
| 2017-01-14 04:14:34 | -1.71 |
| 2017-01-14 04:04:35 | -1.55 |
| 2017-01-14 03:54:34 | -1.62 |
| 2017-01-14 03:44:34 | -1.67 |
| 2017-01-14 03:34:34 | -1.67 |
| 2017-01-14 03:24:35 | -1.69 |
| 2017-01-14 03:14:34 | -1.58 |
| 2017-01-14 03:04:34 | -1.33 |
| 2017-01-14 02:54:34 | -1.2 |
| 2017-01-14 02:44:35 | -1.04 |
| 2017-01-14 02:34:34 | -0.97 |
| 2017-01-14 02:24:34 | -1.02 |
| 2017-01-14 02:14:34 | -1.03 |
| 2017-01-14 02:04:34 | -0.84 |
| 2017-01-14 01:54:35 | -0.76 |
| 2017-01-14 01:44:34 | -0.7 |
| 2017-01-14 01:34:34 | -0.65 |
| 2017-01-14 01:24:34 | -0.63 |
| 2017-01-14 01:14:35 | -0.61 |
| 2017-01-14 01:04:34 | -0.57 |
| 2017-01-14 00:54:34 | -0.55 |
| 2017-01-14 00:44:34 | -0.52 |
| 2017-01-14 00:34:35 | -0.51 |
| 2017-01-14 00:24:34 | -0.51 |
| 2017-01-14 00:14:34 | -0.5 |
| 2017-01-14 00:04:34 | -0.45 |
| 2017-01-13 23:54:34 | -0.51 |
| 2017-01-13 23:44:34 | -0.5 |
| 2017-01-13 23:34:34 | -0.44 |
| 2017-01-13 23:24:34 | -0.51 |
| 2017-01-13 23:14:34 | -0.5 |
| 2017-01-13 23:04:35 | -0.55 |
| 2017-01-13 22:54:34 | -0.51 |
| 2017-01-13 22:44:34 | -0.48 |
| 2017-01-13 22:34:34 | -0.52 |
| 2017-01-13 22:24:35 | -0.47 |
| 2017-01-13 22:14:34 | -0.46 |
| 2017-01-13 22:04:34 | -0.44 |
| 2017-01-13 21:54:34 | -0.42 |
| 2017-01-13 21:44:34 | -0.4 |
| 2017-01-13 21:34:34 | -0.31 |
| 2017-01-13 21:24:34 | -0.36 |
| 2017-01-13 21:14:34 | -0.33 |
| 2017-01-13 21:04:34 | -0.31 |
| 2017-01-13 20:54:35 | -0.29 |
| 2017-01-13 20:44:34 | -0.25 |
| 2017-01-13 20:34:34 | -0.3 |
| 2017-01-13 20:24:34 | -0.24 |
| 2017-01-13 20:14:35 | -0.22 |
| 2017-01-13 20:04:34 | -0.2 |
| 2017-01-13 19:54:34 | -0.18 |
| 2017-01-13 19:44:34 | -0.19 |
| 2017-01-13 19:34:34 | -0.16 |
| 2017-01-13 19:24:35 | -0.23 |
| 2017-01-13 19:14:34 | -0.18 |
| 2017-01-13 19:04:34 | -0.2 |
| 2017-01-13 18:54:34 | -0.23 |
| 2017-01-13 18:44:35 | -0.22 |
| 2017-01-13 18:34:34 | -0.18 |
| 2017-01-13 18:24:34 | -0.15 |
| 2017-01-13 18:14:34 | -0.08 |
| 2017-01-13 18:04:35 | -0.15 |
| 2017-01-13 17:54:34 | -0.09 |
| 2017-01-13 17:44:34 | -0.07 |
| 2017-01-13 17:34:34 | -0.02 |
| 2017-01-13 17:24:34 | -0.06 |
| 2017-01-13 17:14:35 | -0.02 |
| 2017-01-13 17:04:34 | 0.05 |
| 2017-01-13 16:54:34 | 0.04 |
| 2017-01-13 16:44:34 | 0.04 |
| 2017-01-13 16:34:35 | 0.14 |
| 2017-01-13 16:24:34 | 0.11 |
| 2017-01-13 16:14:34 | 0.16 |
| 2017-01-13 16:04:34 | 0.17 |
| 2017-01-13 15:54:35 | 0.21 |
| 2017-01-13 15:44:34 | 0.24 |
| 2017-01-13 15:34:34 | 0.32 |
| 2017-01-13 15:24:34 | 0.37 |
| 2017-01-13 15:14:34 | 0.36 |
| 2017-01-13 15:04:35 | 0.4 |
| 2017-01-13 14:54:34 | 0.43 |
| 2017-01-13 14:44:34 | 0.61 |
| 2017-01-13 14:34:34 | 0.73 |
| 2017-01-13 14:24:35 | 0.83 |
| 2017-01-13 14:14:34 | 0.71 |
| 2017-01-13 14:04:34 | 0.75 |
| 2017-01-13 13:54:34 | 0.71 |
| 2017-01-13 13:44:35 | 0.8 |
| 2017-01-13 13:34:34 | 0.72 |
| 2017-01-13 13:24:34 | 0.83 |
| 2017-01-13 13:14:34 | 0.72 |
| 2017-01-13 13:04:34 | 0.78 |
| 2017-01-13 12:54:35 | 0.84 |
| 2017-01-13 12:44:34 | 0.82 |
| 2017-01-13 12:34:34 | 0.84 |
| 2017-01-13 12:24:34 | 0.82 |
| 2017-01-13 12:14:35 | 0.79 |
| 2017-01-13 12:04:34 | 0.9 |
| 2017-01-13 11:54:34 | 0.84 |
| 2017-01-13 11:44:34 | 0.81 |
| 2017-01-13 11:34:34 | 0.82 |
| 2017-01-13 11:24:34 | 0.84 |
| 2017-01-13 11:14:34 | 0.9 |
| 2017-01-13 11:04:34 | 0.84 |
| 2017-01-13 10:54:34 | 0.93 |
| 2017-01-13 10:44:35 | 0.9 |
| 2017-01-13 10:34:34 | 0.88 |
| 2017-01-13 10:24:34 | 0.9 |
| 2017-01-13 10:14:34 | 0.91 |
| 2017-01-13 10:04:35 | 0.93 |
| 2017-01-13 09:54:34 | 0.84 |
| 2017-01-13 09:44:34 | 0.81 |
| 2017-01-13 09:34:34 | 0.9 |
| 2017-01-13 09:24:34 | 0.88 |
| 2017-01-13 09:14:34 | 0.88 |
| 2017-01-13 09:04:34 | 0.9 |
| 2017-01-13 08:54:34 | 0.82 |
| 2017-01-13 08:44:34 | 0.75 |
| 2017-01-13 08:34:35 | 0.71 |
| 2017-01-13 08:24:34 | 0.59 |
| 2017-01-13 08:14:34 | 0.66 |
| 2017-01-13 08:04:34 | 0.44 |
| 2017-01-13 07:54:35 | 0.32 |
| 2017-01-13 07:44:34 | 0.45 |
| 2017-01-13 07:34:34 | 0.32 |
| 2017-01-13 07:24:34 | 0.07 |
| 2017-01-13 07:14:34 | 0.11 |
| 2017-01-13 07:04:34 | 0.09 |
| 2017-01-13 06:54:34 | 0.09 |
| 2017-01-13 06:44:34 | 0.17 |
| 2017-01-13 06:34:34 | 0.19 |
| 2017-01-13 06:24:35 | 0.2 |
| 2017-01-13 06:14:34 | 0.19 |
| 2017-01-13 06:04:34 | 0.23 |
| 2017-01-13 05:54:34 | 0.24 |
| 2017-01-13 05:44:35 | 0.21 |
| 2017-01-13 05:34:34 | 0.24 |
| 2017-01-13 05:24:34 | 0.15 |
| 2017-01-13 05:14:34 | 0.14 |
| 2017-01-13 05:04:34 | 0.1 |
| 2017-01-13 04:54:35 | 0.12 |
| 2017-01-13 04:44:34 | 0.13 |
| 2017-01-13 04:34:34 | 0.07 |
| 2017-01-13 04:24:34 | 0.05 |
| 2017-01-13 04:14:35 | -0.02 |
| 2017-01-13 04:04:34 | 0.01 |
| 2017-01-13 03:54:34 | -0.04 |
| 2017-01-13 03:44:34 | -0.07 |
| 2017-01-13 03:34:35 | -0.06 |
| 2017-01-13 03:24:34 | -0.09 |
| 2017-01-13 03:14:34 | -0.12 |
| 2017-01-13 03:04:34 | -0.14 |
| 2017-01-13 02:54:34 | -0.16 |
| 2017-01-13 02:44:35 | -0.22 |
| 2017-01-13 02:34:34 | -0.29 |
| 2017-01-13 02:24:34 | -0.35 |
| 2017-01-13 02:14:34 | -0.33 |
| 2017-01-13 02:04:35 | -0.36 |
| 2017-01-13 01:54:34 | -0.38 |
| 2017-01-13 01:44:34 | -0.4 |
| 2017-01-13 01:34:34 | -0.51 |
| 2017-01-13 01:24:35 | -0.52 |
| 2017-01-13 01:14:34 | -0.5 |
| 2017-01-13 01:04:34 | -0.52 |
| 2017-01-13 00:54:34 | -0.52 |
| 2017-01-13 00:44:34 | -0.5 |
| 2017-01-13 00:34:35 | -0.52 |
| 2017-01-13 00:24:34 | -0.55 |
| 2017-01-13 00:14:34 | -0.54 |
| 2017-01-13 00:04:34 | -0.58 |
| 2017-01-12 23:54:35 | -0.55 |
| 2017-01-12 23:44:34 | -0.52 |
| 2017-01-12 23:34:34 | -0.55 |
| 2017-01-12 23:24:34 | -0.54 |
| 2017-01-12 23:14:34 | -0.48 |
| 2017-01-12 23:04:34 | -0.48 |
| 2017-01-12 22:54:34 | -0.51 |
| 2017-01-12 22:44:34 | -0.44 |
| 2017-01-12 22:34:34 | -0.49 |
| 2017-01-12 22:24:35 | -0.5 |
| 2017-01-12 22:14:34 | -0.63 |
| 2017-01-12 22:04:34 | -0.74 |
| 2017-01-12 21:54:34 | -0.74 |
| 2017-01-12 21:44:35 | -0.75 |
| 2017-01-12 21:34:34 | -0.8 |
| 2017-01-12 21:24:34 | -0.7 |
| 2017-01-12 21:14:34 | -0.77 |
| 2017-01-12 21:04:35 | -0.82 |
| 2017-01-12 20:54:34 | -0.86 |
| 2017-01-12 20:44:34 | -0.87 |
| 2017-01-12 20:34:34 | -0.86 |
| 2017-01-12 20:24:34 | -0.87 |
| 2017-01-12 20:14:35 | -0.89 |
| 2017-01-12 20:04:34 | -0.82 |
| 2017-01-12 19:54:34 | -0.81 |
| 2017-01-12 19:44:34 | -0.78 |
| 2017-01-12 19:34:35 | -0.81 |
| 2017-01-12 19:24:34 | -0.74 |
| 2017-01-12 19:14:34 | -0.79 |
| 2017-01-12 19:04:34 | -0.7 |
| 2017-01-12 18:54:34 | -0.68 |
| 2017-01-12 18:44:34 | -0.65 |
| 2017-01-12 18:34:34 | -0.65 |
| 2017-01-12 18:24:34 | -0.62 |
| 2017-01-12 18:14:34 | -0.48 |
| 2017-01-12 18:04:35 | -0.47 |
| 2017-01-12 17:54:34 | -0.5 |
| 2017-01-12 17:44:34 | -0.49 |
| 2017-01-12 17:34:34 | -0.4 |
| 2017-01-12 17:24:35 | -0.42 |
| 2017-01-12 17:14:34 | -0.35 |
| 2017-01-12 17:04:34 | -0.27 |
| 2017-01-12 16:54:34 | -0.17 |
| 2017-01-12 16:44:35 | 0.01 |
| 2017-01-12 16:34:34 | 0.08 |
| 2017-01-12 16:24:34 | 0.13 |
| 2017-01-12 16:14:34 | 0.22 |
| 2017-01-12 16:04:34 | 0.28 |
| 2017-01-12 15:54:35 | 0.38 |
| 2017-01-12 15:44:34 | 0.41 |
| 2017-01-12 15:34:34 | 0.58 |
| 2017-01-12 15:24:34 | 0.52 |
| 2017-01-12 15:14:35 | 0.57 |
| 2017-01-12 15:04:34 | 0.5 |
| 2017-01-12 14:54:34 | 0.58 |
| 2017-01-12 14:44:34 | 0.54 |
| 2017-01-12 14:34:34 | 0.57 |
| 2017-01-12 14:24:35 | 0.5 |
| 2017-01-12 14:14:34 | 0.5 |
| 2017-01-12 14:04:34 | 0.41 |
| 2017-01-12 13:54:34 | 0.44 |
| 2017-01-12 13:44:35 | 0.35 |
| 2017-01-12 13:34:34 | 0.26 |
| 2017-01-12 13:24:34 | 0.15 |
| 2017-01-12 13:14:34 | 0.04 |
| 2017-01-12 13:04:35 | -0.01 |
| 2017-01-12 12:54:34 | -0.12 |
| 2017-01-12 12:44:34 | -0.24 |
| 2017-01-12 12:34:34 | -0.32 |
| 2017-01-12 12:24:34 | -0.42 |
| 2017-01-12 12:14:35 | -0.6 |
| 2017-01-12 12:04:34 | -0.66 |
| 2017-01-12 11:54:34 | -0.72 |
| 2017-01-12 11:44:34 | -0.82 |
| 2017-01-12 11:34:35 | -0.96 |
| 2017-01-12 11:24:34 | -1.04 |
| 2017-01-12 11:14:34 | -1.12 |
| 2017-01-12 11:04:34 | -1.24 |
| 2017-01-12 10:54:35 | -1.28 |
| 2017-01-12 10:44:34 | -1.34 |
| 2017-01-12 10:34:34 | -1.43 |
| 2017-01-12 10:24:34 | -1.52 |
| 2017-01-12 10:14:34 | -1.47 |
| 2017-01-12 10:04:35 | -1.67 |
| 2017-01-12 09:54:34 | -1.68 |
| 2017-01-12 09:44:34 | -1.71 |
| 2017-01-12 09:34:34 | -1.72 |
| 2017-01-12 09:24:35 | -1.73 |
| 2017-01-12 09:14:34 | -1.93 |
| 2017-01-12 09:04:34 | -2 |
| 2017-01-12 08:54:34 | -2.02 |
| 2017-01-12 08:44:35 | -2.13 |
| 2017-01-12 08:34:34 | -2.3 |
| 2017-01-12 08:24:34 | -2.31 |
| 2017-01-12 08:14:34 | -2.32 |
| 2017-01-12 08:04:34 | -2.5 |
| 2017-01-12 07:54:35 | -2.64 |
| 2017-01-12 07:44:34 | -2.92 |
| 2017-01-12 07:34:34 | -3.13 |
| 2017-01-12 07:24:34 | -3.3 |
| 2017-01-12 07:14:35 | -3.34 |
| 2017-01-12 07:04:34 | -3.62 |
| 2017-01-12 06:54:34 | -3.83 |
| 2017-01-12 06:44:34 | -4 |
| 2017-01-12 06:34:35 | -4.27 |
| 2017-01-12 06:24:34 | -4.54 |
| 2017-01-12 06:14:34 | -4.94 |
| 2017-01-12 06:04:34 | -5.69 |
| 2017-01-12 05:54:34 | -5.71 |
| 2017-01-12 05:44:35 | -6.55 |
| 2017-01-12 05:34:34 | -6.66 |
| 2017-01-12 05:24:34 | -6.79 |
| 2017-01-12 05:14:34 | -6.78 |
| 2017-01-12 05:04:35 | -6.8 |
| 2017-01-12 04:54:34 | -6.78 |
| 2017-01-12 04:44:34 | -6.86 |
| 2017-01-12 04:34:34 | -6.94 |
| 2017-01-12 04:24:35 | -6.94 |
| 2017-01-12 04:14:34 | -7 |
| 2017-01-12 04:04:34 | -6.99 |
| 2017-01-12 03:54:34 | -7.09 |
| 2017-01-12 03:44:35 | -7.11 |
| 2017-01-12 03:34:34 | -7.16 |
| 2017-01-12 03:24:34 | -7.11 |
| 2017-01-12 03:14:34 | -7.13 |
| 2017-01-12 03:04:34 | -7.16 |
| 2017-01-12 02:54:35 | -7.24 |
| 2017-01-12 02:44:34 | -7.24 |
| 2017-01-12 02:34:34 | -7.32 |
| 2017-01-12 02:24:34 | -7.29 |
| 2017-01-12 02:14:35 | -7.35 |
| 2017-01-12 02:04:34 | -7.48 |
| 2017-01-12 01:54:34 | -7.43 |
| 2017-01-12 01:44:34 | -7.53 |
| 2017-01-12 01:34:35 | -7.55 |
| 2017-01-12 01:24:34 | -7.61 |
| 2017-01-12 01:14:34 | -7.58 |
| 2017-01-12 01:04:34 | -7.65 |
| 2017-01-12 00:54:34 | -7.7 |
| 2017-01-12 00:44:35 | -7.75 |
| 2017-01-12 00:34:34 | -7.76 |
| 2017-01-12 00:24:34 | -7.77 |
| 2017-01-12 00:14:34 | -7.82 |
| 2017-01-12 00:04:35 | -7.82 |
| 2017-01-11 23:54:34 | -7.78 |
| 2017-01-11 23:44:34 | -7.85 |
| 2017-01-11 23:34:34 | -7.86 |
| 2017-01-11 23:24:35 | -7.97 |
| 2017-01-11 23:14:34 | -8.03 |
| 2017-01-11 23:04:34 | -8.03 |
| 2017-01-11 22:54:34 | -8.02 |
| 2017-01-11 22:44:34 | -8.03 |
| 2017-01-11 22:34:35 | -8.02 |
| 2017-01-11 22:24:34 | -8.03 |
| 2017-01-11 22:14:34 | -8.07 |
| 2017-01-11 22:04:34 | -8.06 |
| 2017-01-11 21:54:35 | -8.05 |
| 2017-01-11 21:44:34 | -8.09 |
| 2017-01-11 21:34:34 | -8.14 |
| 2017-01-11 21:24:34 | -8.19 |
| 2017-01-11 21:14:35 | -8.22 |
| 2017-01-11 21:04:34 | -8.28 |
| 2017-01-11 20:54:34 | -8.26 |
| 2017-01-11 20:44:34 | -8.32 |
| 2017-01-11 20:34:34 | -8.39 |
| 2017-01-11 20:24:35 | -8.45 |
| 2017-01-11 20:14:34 | -8.5 |
| 2017-01-11 20:04:34 | -8.57 |
| 2017-01-11 19:54:34 | -8.66 |
| 2017-01-11 19:44:35 | -8.66 |
| 2017-01-11 19:34:34 | -8.71 |
| 2017-01-11 19:24:34 | -8.79 |
| 2017-01-11 19:14:34 | -8.85 |
| 2017-01-11 19:04:35 | -8.93 |
| 2017-01-11 18:54:34 | -9.03 |
| 2017-01-11 18:44:34 | -9.02 |
| 2017-01-11 18:34:34 | -9.06 |
| 2017-01-11 18:24:34 | -9.01 |
| 2017-01-11 18:14:35 | -9.09 |
| 2017-01-11 18:04:34 | -9.1 |
| 2017-01-11 17:54:34 | -9.07 |
| 2017-01-11 17:44:34 | -9.16 |
| 2017-01-11 17:34:35 | -9.23 |
| 2017-01-11 17:24:34 | -9.24 |
| 2017-01-11 17:14:34 | -9.31 |
| 2017-01-11 17:04:34 | -9.3 |
| 2017-01-11 16:54:35 | -9.4 |
| 2017-01-11 16:44:34 | -9.32 |
| 2017-01-11 16:34:34 | -9.42 |
| 2017-01-11 16:24:34 | -9.4 |
| 2017-01-11 16:14:34 | -9.35 |
| 2017-01-11 16:04:35 | -9.37 |
| 2017-01-11 15:54:34 | -9.33 |
| 2017-01-11 15:44:34 | -9.38 |
| 2017-01-11 15:34:34 | -9.33 |
| 2017-01-11 15:24:35 | -9.31 |
| 2017-01-11 15:14:34 | -9.4 |
| 2017-01-11 15:04:34 | -9.36 |
| 2017-01-11 14:54:34 | -9.37 |
| 2017-01-11 14:44:35 | -9.39 |
| 2017-01-11 14:34:34 | -9.51 |
| 2017-01-11 14:24:34 | -9.63 |
| 2017-01-11 14:14:34 | -9.71 |
| 2017-01-11 14:04:34 | -9.78 |
| 2017-01-11 13:54:35 | -9.84 |
| 2017-01-11 13:44:34 | -10.07 |
| 2017-01-11 13:34:34 | -10.25 |
| 2017-01-11 13:24:34 | -10.45 |
| 2017-01-11 13:14:35 | -10.56 |
| 2017-01-11 13:04:34 | -10.69 |
| 2017-01-11 12:54:34 | -10.95 |
| 2017-01-11 12:44:34 | -11.18 |
| 2017-01-11 12:34:34 | -11.51 |
| 2017-01-11 12:24:34 | -11.79 |
| 2017-01-11 12:14:34 | -12.04 |
| 2017-01-11 12:04:34 | -12.42 |
| 2017-01-11 11:54:34 | -12.76 |
| 2017-01-11 11:44:35 | -13.04 |
| 2017-01-11 11:34:34 | -13.37 |
| 2017-01-11 11:24:32 | -13.73 |
| 2017-01-11 11:14:32 | -13.98 |
| 2017-01-11 11:04:33 | -14.1 |
| 2017-01-11 10:54:32 | -14.03 |
| 2017-01-11 10:44:32 | -14.14 |
| 2017-01-11 10:34:32 | -14.48 |
| 2017-01-11 10:24:32 | -14.93 |
| 2017-01-11 10:14:32 | -15.21 |
| 2017-01-11 10:04:32 | -15.63 |
| 2017-01-11 09:54:32 | -15.98 |
| 2017-01-11 09:44:32 | -16.35 |
| 2017-01-11 09:34:33 | -16.55 |
| 2017-01-11 09:24:32 | -16.63 |
| 2017-01-11 09:14:32 | -16.64 |
| 2017-01-11 09:04:32 | -16.85 |
| 2017-01-11 08:54:33 | -16.95 |
| 2017-01-11 08:44:32 | -17.06 |
| 2017-01-11 08:34:32 | -17 |
| 2017-01-11 08:24:32 | -16.96 |
| 2017-01-11 08:14:32 | -17.04 |
| 2017-01-11 08:04:33 | -17.03 |
| 2017-01-11 07:54:32 | -16.88 |
| 2017-01-11 07:44:32 | -16.75 |
| 2017-01-11 07:34:32 | -16.6 |
| 2017-01-11 07:24:33 | -16.7 |
| 2017-01-11 07:14:32 | -16.63 |
| 2017-01-11 07:04:32 | -16.61 |
| 2017-01-11 06:54:32 | -16.47 |
| 2017-01-11 06:44:33 | -16.27 |
| 2017-01-11 06:34:32 | -16.21 |
| 2017-01-11 06:24:32 | -16.2 |
| 2017-01-11 06:14:32 | -16.16 |
| 2017-01-11 06:04:32 | -16.14 |
| 2017-01-11 05:54:33 | -16.13 |
| 2017-01-11 05:44:32 | -16.05 |
| 2017-01-11 05:34:32 | -15.98 |
| 2017-01-11 05:24:32 | -15.77 |
| 2017-01-11 05:14:33 | -15.74 |
| 2017-01-11 05:04:32 | -15.69 |
| 2017-01-11 04:54:32 | -15.48 |
| 2017-01-11 04:44:32 | -15.43 |
| 2017-01-11 04:34:33 | -15.33 |
| 2017-01-11 04:24:32 | -15.3 |
| 2017-01-11 04:14:32 | -15.26 |
| 2017-01-11 04:04:32 | -15.18 |
| 2017-01-11 03:54:32 | -15.07 |
| 2017-01-11 03:44:33 | -15.04 |
| 2017-01-11 03:34:32 | -14.92 |
| 2017-01-11 03:24:32 | -14.77 |
| 2017-01-11 03:14:32 | -14.66 |
| 2017-01-11 03:04:33 | -14.47 |
| 2017-01-11 02:54:32 | -14.49 |
| 2017-01-11 02:44:32 | -14.43 |
| 2017-01-11 02:34:32 | -14.29 |
| 2017-01-11 02:24:33 | -14.24 |
| 2017-01-11 02:14:32 | -14.21 |
| 2017-01-11 02:04:32 | -14.21 |
| 2017-01-11 01:54:32 | -14.08 |
| 2017-01-11 01:44:32 | -13.92 |
| 2017-01-11 01:34:33 | -13.83 |
| 2017-01-11 01:24:32 | -13.79 |
| 2017-01-11 01:14:32 | -13.76 |
| 2017-01-11 01:04:32 | -13.78 |
| 2017-01-11 00:54:33 | -13.69 |
| 2017-01-11 00:44:32 | -13.54 |
| 2017-01-11 00:34:32 | -13.5 |
| 2017-01-11 00:24:32 | -13.31 |
| 2017-01-11 00:14:33 | -13.24 |
| 2017-01-11 00:04:32 | -13.19 |
| 2017-01-10 23:54:32 | -13.06 |
| 2017-01-10 23:44:32 | -12.99 |
| 2017-01-10 23:34:32 | -12.88 |
| 2017-01-10 23:24:33 | -12.82 |
| 2017-01-10 23:14:32 | -12.72 |
| 2017-01-10 23:04:32 | -12.68 |
| 2017-01-10 22:54:32 | -12.51 |
| 2017-01-10 22:44:33 | -12.41 |
| 2017-01-10 22:34:32 | -12.31 |
| 2017-01-10 22:24:32 | -12.17 |
| 2017-01-10 22:14:32 | -12.08 |
| 2017-01-10 22:04:32 | -11.91 |
| 2017-01-10 21:54:32 | -11.9 |
| 2017-01-10 21:44:32 | -11.89 |
| 2017-01-10 21:34:32 | -11.88 |
| 2017-01-10 21:24:32 | -11.75 |
| 2017-01-10 21:14:33 | -11.68 |
| 2017-01-10 21:04:32 | -11.56 |
| 2017-01-10 20:54:32 | -11.41 |
| 2017-01-10 20:44:32 | -11.47 |
| 2017-01-10 20:34:33 | -11.49 |
| 2017-01-10 20:24:32 | -11.32 |
| 2017-01-10 20:14:32 | -11.15 |
| 2017-01-10 20:04:32 | -10.85 |
| 2017-01-10 19:54:33 | -10.7 |
| 2017-01-10 19:44:32 | -10.49 |
| 2017-01-10 19:34:32 | -10.3 |
| 2017-01-10 19:24:32 | -10.01 |
| 2017-01-10 19:14:32 | -9.89 |
| 2017-01-10 19:04:33 | -9.67 |
| 2017-01-10 18:54:32 | -9.24 |
| 2017-01-10 18:44:32 | -9.01 |
| 2017-01-10 18:34:32 | -8.68 |
| 2017-01-10 18:24:33 | -8.56 |
| 2017-01-10 18:14:32 | -8.38 |
| 2017-01-10 18:04:32 | -8.07 |
| 2017-01-10 17:54:32 | -7.78 |
| 2017-01-10 17:44:33 | -7.46 |
| 2017-01-10 17:34:32 | -7.18 |
| 2017-01-10 17:24:32 | -7.05 |
| 2017-01-10 17:14:32 | -6.88 |
| 2017-01-10 17:04:32 | -6.87 |
| 2017-01-10 16:54:33 | -6.63 |
| 2017-01-10 16:44:32 | -6.51 |
| 2017-01-10 16:34:32 | -6.37 |
| 2017-01-10 16:24:32 | -6.36 |
| 2017-01-10 16:14:33 | -6.35 |
| 2017-01-10 16:04:32 | -6.31 |
| 2017-01-10 15:54:32 | -6.19 |
| 2017-01-10 15:44:32 | -6.15 |
| 2017-01-10 15:34:32 | -6.06 |
| 2017-01-10 15:24:33 | -6.06 |
| 2017-01-10 15:14:32 | -5.93 |
| 2017-01-10 15:04:32 | -5.91 |
| 2017-01-10 14:54:32 | -5.83 |
| 2017-01-10 14:44:33 | -5.94 |
| 2017-01-10 14:34:32 | -5.93 |
| 2017-01-10 14:24:32 | -5.82 |
| 2017-01-10 14:14:32 | -5.69 |
| 2017-01-10 14:04:33 | -5.67 |
| 2017-01-10 13:54:32 | -5.58 |
| 2017-01-10 13:44:32 | -5.53 |
| 2017-01-10 13:34:32 | -5.46 |
| 2017-01-10 13:24:32 | -5.37 |
| 2017-01-10 13:14:32 | -5.27 |
| 2017-01-10 13:04:32 | -5.33 |
| 2017-01-10 12:54:32 | -5.28 |
| 2017-01-10 12:44:32 | -5.28 |
| 2017-01-10 12:34:33 | -5.26 |
| 2017-01-10 12:24:32 | -5.26 |
| 2017-01-10 12:14:32 | -5.18 |
| 2017-01-10 12:04:32 | -5.2 |
| 2017-01-10 11:54:33 | -5.15 |
| 2017-01-10 11:44:32 | -5.24 |
| 2017-01-10 11:34:32 | -5.32 |
| 2017-01-10 11:24:32 | -5.23 |
| 2017-01-10 11:14:32 | -5.21 |
| 2017-01-10 11:04:32 | -5.17 |
| 2017-01-10 10:54:32 | -5.2 |
| 2017-01-10 10:44:32 | -5.13 |
| 2017-01-10 10:34:32 | -5.17 |
| 2017-01-10 10:24:33 | -5.09 |
| 2017-01-10 10:14:32 | -5.09 |
| 2017-01-10 10:04:32 | -5.07 |
| 2017-01-10 09:54:32 | -5.08 |
| 2017-01-10 09:44:33 | -5.1 |
| 2017-01-10 09:34:32 | -5.09 |
| 2017-01-10 09:24:32 | -5.17 |
| 2017-01-10 09:14:32 | -5.19 |
| 2017-01-10 09:04:32 | -5.23 |
| 2017-01-10 08:54:33 | -5.22 |
| 2017-01-10 08:44:32 | -5.22 |
| 2017-01-10 08:34:26 | -5.23 |
| 2017-01-10 08:24:26 | -5.28 |
| 2017-01-10 08:14:27 | -5.28 |
| 2017-01-10 08:04:26 | -5.32 |
| 2017-01-10 07:54:26 | -5.31 |
| 2017-01-10 07:44:26 | -5.28 |
| 2017-01-10 07:34:27 | -5.35 |
| 2017-01-10 07:24:26 | -5.35 |
| 2017-01-10 07:14:26 | -5.39 |
| 2017-01-10 07:04:26 | -5.39 |
| 2017-01-10 06:54:26 | -5.37 |
| 2017-01-10 06:44:27 | -5.37 |
| 2017-01-10 06:34:26 | -5.32 |
| 2017-01-10 06:24:26 | -5.28 |
| 2017-01-10 06:14:26 | -5.25 |
| 2017-01-10 06:04:27 | -5.28 |
| 2017-01-10 05:54:26 | -5.26 |
| 2017-01-10 05:44:26 | -5.31 |
| 2017-01-10 05:34:26 | -5.32 |
| 2017-01-10 05:24:27 | -5.31 |
| 2017-01-10 05:14:26 | -5.17 |
| 2017-01-10 05:04:26 | -5.27 |
| 2017-01-10 04:54:26 | -5.3 |
| 2017-01-10 04:44:26 | -5.26 |
| 2017-01-10 04:34:27 | -5.23 |
| 2017-01-10 04:24:26 | -5.19 |
| 2017-01-10 04:14:26 | -5.21 |
| 2017-01-10 04:04:26 | -5.19 |
| 2017-01-10 03:54:27 | -5.19 |
| 2017-01-10 03:44:26 | -5.15 |
| 2017-01-10 03:34:26 | -5.22 |
| 2017-01-10 03:24:26 | -5.2 |
| 2017-01-10 03:14:27 | -5.18 |
| 2017-01-10 03:04:26 | -5.19 |
| 2017-01-10 02:54:26 | -5.18 |
| 2017-01-10 02:44:26 | -5.18 |
| 2017-01-10 02:34:26 | -5.12 |
| 2017-01-10 02:24:27 | -5.09 |
| 2017-01-10 02:14:26 | -5.17 |
| 2017-01-10 02:04:26 | -5.17 |
| 2017-01-10 01:54:26 | -5.09 |
| 2017-01-10 01:44:27 | -5.1 |
| 2017-01-10 01:34:26 | -5.16 |
| 2017-01-10 01:24:26 | -5.09 |
| 2017-01-10 01:14:26 | -5.08 |
| 2017-01-10 01:04:27 | -5.11 |
| 2017-01-10 00:54:26 | -5.04 |
| 2017-01-10 00:44:26 | -5.07 |
| 2017-01-10 00:34:26 | -5.12 |
| 2017-01-10 00:24:26 | -5.02 |
| 2017-01-10 00:14:27 | -5.07 |
| 2017-01-10 00:04:26 | -5.02 |
| 2017-01-09 23:54:26 | -4.93 |
| 2017-01-09 23:44:26 | -4.96 |
| 2017-01-09 23:34:27 | -5.01 |
| 2017-01-09 23:24:26 | -4.96 |
| 2017-01-09 23:14:26 | -4.97 |
| 2017-01-09 23:04:26 | -4.92 |
| 2017-01-09 22:54:27 | -4.97 |
| 2017-01-09 22:44:26 | -4.89 |
| 2017-01-09 22:34:26 | -4.9 |
| 2017-01-09 22:24:26 | -4.92 |
| 2017-01-09 22:14:26 | -4.92 |
| 2017-01-09 22:04:27 | -4.87 |
| 2017-01-09 21:54:26 | -4.79 |
| 2017-01-09 21:44:26 | -4.9 |
| 2017-01-09 21:34:26 | -4.79 |
| 2017-01-09 21:24:27 | -4.8 |
| 2017-01-09 21:14:26 | -4.8 |
| 2017-01-09 21:04:26 | -4.84 |
| 2017-01-09 20:54:26 | -4.76 |
| 2017-01-09 20:44:27 | -4.81 |
| 2017-01-09 20:34:26 | -4.81 |
| 2017-01-09 20:24:26 | -4.83 |
| 2017-01-09 20:14:26 | -4.84 |
| 2017-01-09 20:04:26 | -4.79 |
| 2017-01-09 19:54:27 | -4.81 |
| 2017-01-09 19:44:26 | -4.9 |
| 2017-01-09 19:34:26 | -4.88 |
| 2017-01-09 19:24:26 | -4.89 |
| 2017-01-09 19:14:27 | -4.81 |
| 2017-01-09 19:04:26 | -4.82 |
| 2017-01-09 18:54:26 | -4.82 |
| 2017-01-09 18:44:26 | -4.88 |
| 2017-01-09 18:34:27 | -4.81 |
| 2017-01-09 18:24:26 | -4.86 |
| 2017-01-09 18:14:26 | -4.89 |
| 2017-01-09 18:04:26 | -4.86 |
| 2017-01-09 17:54:26 | -4.9 |
| 2017-01-09 17:44:27 | -4.9 |
| 2017-01-09 17:34:26 | -4.89 |
| 2017-01-09 17:24:26 | -4.92 |
| 2017-01-09 17:14:26 | -4.88 |
| 2017-01-09 17:04:27 | -4.86 |
| 2017-01-09 16:54:26 | -4.84 |
| 2017-01-09 16:44:26 | -4.88 |
| 2017-01-09 16:34:26 | -4.8 |
| 2017-01-09 16:24:27 | -4.81 |
| 2017-01-09 16:14:26 | -4.77 |
| 2017-01-09 16:04:26 | -4.8 |
| 2017-01-09 15:54:26 | -4.8 |
| 2017-01-09 15:44:26 | -4.8 |
| 2017-01-09 15:34:27 | -4.76 |
| 2017-01-09 15:24:26 | -4.8 |
| 2017-01-09 15:14:26 | -4.8 |
| 2017-01-09 15:04:26 | -4.75 |
| 2017-01-09 14:54:27 | -4.86 |
| 2017-01-09 14:44:26 | -4.92 |
| 2017-01-09 14:34:26 | -4.97 |
| 2017-01-09 14:24:26 | -4.98 |
| 2017-01-09 14:14:26 | -5.02 |
| 2017-01-09 14:04:27 | -5.04 |
| 2017-01-09 13:54:26 | -5.13 |
| 2017-01-09 13:44:26 | -5.24 |
| 2017-01-09 13:34:26 | -5.17 |
| 2017-01-09 13:24:27 | -5.3 |
| 2017-01-09 13:14:26 | -5.4 |
| 2017-01-09 13:04:26 | -5.51 |
| 2017-01-09 12:54:26 | -5.61 |
| 2017-01-09 12:44:27 | -5.63 |
| 2017-01-09 12:34:26 | -5.71 |
| 2017-01-09 12:24:26 | -5.76 |
| 2017-01-09 12:14:26 | -5.8 |
| 2017-01-09 12:04:26 | -5.84 |
| 2017-01-09 11:54:27 | -5.96 |
| 2017-01-09 11:44:26 | -6.01 |
| 2017-01-09 11:34:26 | -6.11 |
| 2017-01-09 11:24:26 | -6.14 |
| 2017-01-09 11:14:27 | -6.17 |
| 2017-01-09 11:04:26 | -6.32 |
| 2017-01-09 10:54:26 | -6.52 |
| 2017-01-09 10:44:26 | -6.58 |
| 2017-01-09 10:34:27 | -6.66 |
| 2017-01-09 10:24:26 | -6.78 |
| 2017-01-09 10:14:26 | -6.82 |
| 2017-01-09 10:04:26 | -6.9 |
| 2017-01-09 09:54:26 | -6.97 |
| 2017-01-09 09:44:27 | -7.06 |
| 2017-01-09 09:34:26 | -7.12 |
| 2017-01-09 09:24:26 | -7.09 |
| 2017-01-09 09:14:26 | -7.11 |
| 2017-01-09 09:04:27 | -7.14 |
| 2017-01-09 08:54:26 | -7.17 |
| 2017-01-09 08:44:26 | -7.26 |
| 2017-01-09 08:34:26 | -7.32 |
| 2017-01-09 08:24:27 | -7.28 |
| 2017-01-09 08:14:26 | -7.24 |
| 2017-01-09 08:04:26 | -7.33 |
| 2017-01-09 07:54:26 | -7.33 |
| 2017-01-09 07:44:26 | -7.34 |
| 2017-01-09 07:34:27 | -7.43 |
| 2017-01-09 07:24:26 | -7.5 |
| 2017-01-09 07:14:26 | -7.38 |
| 2017-01-09 07:04:26 | -7.52 |
| 2017-01-09 06:54:27 | -7.46 |
| 2017-01-09 06:44:26 | -7.47 |
| 2017-01-09 06:34:26 | -7.55 |
| 2017-01-09 06:24:26 | -7.56 |
| 2017-01-09 06:14:27 | -7.69 |
| 2017-01-09 06:04:26 | -7.7 |
| 2017-01-09 05:54:26 | -7.73 |
| 2017-01-09 05:44:26 | -7.82 |
| 2017-01-09 05:34:26 | -7.88 |
| 2017-01-09 05:24:27 | -7.91 |
| 2017-01-09 05:14:26 | -7.88 |
| 2017-01-09 05:04:26 | -7.88 |
| 2017-01-09 04:54:26 | -7.78 |
| 2017-01-09 04:44:27 | -7.77 |
| 2017-01-09 04:34:26 | -7.76 |
| 2017-01-09 04:24:26 | -7.78 |
| 2017-01-09 04:14:26 | -7.78 |
| 2017-01-09 04:04:26 | -7.75 |
| 2017-01-09 03:54:26 | -7.78 |
| 2017-01-09 03:44:26 | -7.87 |
| 2017-01-09 03:34:26 | -7.82 |
| 2017-01-09 03:24:26 | -7.78 |
| 2017-01-09 03:14:27 | -7.77 |
| 2017-01-09 03:04:26 | -7.72 |
| 2017-01-09 02:54:26 | -7.68 |
| 2017-01-09 02:44:26 | -7.71 |
| 2017-01-09 02:34:27 | -7.6 |
| 2017-01-09 02:24:26 | -7.61 |
| 2017-01-09 02:14:26 | -7.62 |
| 2017-01-09 02:04:26 | -7.64 |
| 2017-01-09 01:54:27 | -7.56 |
| 2017-01-09 01:44:26 | -7.58 |
| 2017-01-09 01:34:26 | -7.56 |
| 2017-01-09 01:24:26 | -7.52 |
| 2017-01-09 01:14:26 | -7.5 |
| 2017-01-09 01:04:27 | -7.32 |
| 2017-01-09 00:54:26 | -7.35 |
| 2017-01-09 00:44:26 | -7.41 |
| 2017-01-09 00:34:26 | -7.29 |
| 2017-01-09 00:24:27 | -7.35 |
| 2017-01-09 00:14:26 | -7.29 |
| 2017-01-09 00:04:26 | -7.24 |
| 2017-01-08 23:54:26 | -7.28 |
| 2017-01-08 23:44:26 | -7.2 |
| 2017-01-08 23:34:26 | -7.16 |
| 2017-01-08 23:24:26 | -7.19 |
| 2017-01-08 23:14:26 | -7.15 |
| 2017-01-08 23:04:26 | -7.15 |
| 2017-01-08 22:54:27 | -7.11 |
| 2017-01-08 22:44:26 | -7.16 |
| 2017-01-08 22:34:26 | -7.1 |
| 2017-01-08 22:24:26 | -7.04 |
| 2017-01-08 22:14:27 | -7.03 |
| 2017-01-08 22:04:26 | -6.99 |
| 2017-01-08 21:54:26 | -6.96 |
| 2017-01-08 21:44:26 | -6.95 |
| 2017-01-08 21:34:26 | -7.01 |
| 2017-01-08 21:24:27 | -6.9 |
| 2017-01-08 21:14:26 | -6.98 |
| 2017-01-08 21:04:26 | -6.94 |
| 2017-01-08 20:54:26 | -6.95 |
| 2017-01-08 20:44:27 | -6.95 |
| 2017-01-08 20:34:26 | -6.9 |
| 2017-01-08 20:24:26 | -6.9 |
| 2017-01-08 20:14:26 | -6.84 |
| 2017-01-08 20:04:27 | -6.85 |
| 2017-01-08 19:54:26 | -6.86 |
| 2017-01-08 19:44:26 | -6.88 |
| 2017-01-08 19:34:26 | -6.79 |
| 2017-01-08 19:24:26 | -6.82 |
| 2017-01-08 19:14:27 | -6.8 |
| 2017-01-08 19:04:26 | -6.78 |
| 2017-01-08 18:54:26 | -6.78 |
| 2017-01-08 18:44:26 | -6.73 |
| 2017-01-08 18:34:27 | -6.69 |
| 2017-01-08 18:24:26 | -6.73 |
| 2017-01-08 18:14:26 | -6.73 |
| 2017-01-08 18:04:26 | -6.81 |
| 2017-01-08 17:54:27 | -6.83 |
| 2017-01-08 17:44:26 | -6.82 |
| 2017-01-08 17:34:26 | -6.76 |
| 2017-01-08 17:24:26 | -6.82 |
| 2017-01-08 17:14:26 | -6.78 |
| 2017-01-08 17:04:27 | -6.79 |
| 2017-01-08 16:54:26 | -6.8 |
| 2017-01-08 16:44:26 | -6.82 |
| 2017-01-08 16:34:26 | -6.75 |
| 2017-01-08 16:24:27 | -6.69 |
| 2017-01-08 16:14:26 | -6.67 |
| 2017-01-08 16:04:26 | -6.66 |
| 2017-01-08 15:54:26 | -6.68 |
| 2017-01-08 15:44:27 | -6.57 |
| 2017-01-08 15:34:26 | -6.63 |
| 2017-01-08 15:24:26 | -6.67 |
| 2017-01-08 15:14:26 | -6.59 |
| 2017-01-08 15:04:26 | -6.72 |
| 2017-01-08 14:54:27 | -6.68 |
| 2017-01-08 14:44:26 | -6.75 |
| 2017-01-08 14:34:26 | -6.79 |
| 2017-01-08 14:24:26 | -6.87 |
| 2017-01-08 14:14:27 | -6.95 |
| 2017-01-08 14:04:26 | -7.01 |
| 2017-01-08 13:54:26 | -7.14 |
| 2017-01-08 13:44:26 | -7.15 |
| 2017-01-08 13:34:27 | -7.2 |
| 2017-01-08 13:24:26 | -7.26 |
| 2017-01-08 13:14:26 | -7.37 |
| 2017-01-08 13:04:26 | -7.53 |
| 2017-01-08 12:54:26 | -7.58 |
| 2017-01-08 12:44:27 | -7.67 |
| 2017-01-08 12:34:26 | -7.88 |
| 2017-01-08 12:24:26 | -7.92 |
| 2017-01-08 12:14:26 | -8.01 |
| 2017-01-08 12:04:27 | -8.08 |
| 2017-01-08 11:54:26 | -8.11 |
| 2017-01-08 11:44:26 | -8.22 |
| 2017-01-08 11:34:26 | -8.28 |
| 2017-01-08 11:24:27 | -8.3 |
| 2017-01-08 11:14:26 | -8.47 |
| 2017-01-08 11:04:26 | -8.45 |
| 2017-01-08 10:54:26 | -8.49 |
| 2017-01-08 10:44:26 | -8.54 |
| 2017-01-08 10:34:27 | -8.64 |
| 2017-01-08 10:24:26 | -8.64 |
| 2017-01-08 10:14:26 | -8.67 |
| 2017-01-08 10:04:26 | -8.74 |
| 2017-01-08 09:54:27 | -8.81 |
| 2017-01-08 09:44:26 | -8.75 |
| 2017-01-08 09:34:20 | -8.78 |
| 2017-01-08 09:24:20 | -8.87 |
| 2017-01-08 09:14:21 | -8.92 |
| 2017-01-08 09:04:20 | -8.91 |
| 2017-01-08 08:54:20 | -8.94 |
| 2017-01-08 08:44:20 | -9.02 |
| 2017-01-08 08:34:20 | -9.09 |
| 2017-01-08 08:24:21 | -9.12 |
| 2017-01-08 08:14:20 | -9.01 |
| 2017-01-08 08:04:20 | -9.06 |
| 2017-01-08 07:54:20 | -9.08 |
| 2017-01-08 07:44:21 | -9.12 |
| 2017-01-08 07:34:20 | -9.1 |
| 2017-01-08 07:24:20 | -9.19 |
| 2017-01-08 07:14:20 | -9.23 |
| 2017-01-08 07:04:21 | -9.25 |
| 2017-01-08 06:54:20 | -9.27 |
| 2017-01-08 06:44:20 | -9.24 |
| 2017-01-08 06:34:20 | -9.34 |
| 2017-01-08 06:24:20 | -9.37 |
| 2017-01-08 06:14:20 | -9.41 |
| 2017-01-08 06:04:20 | -9.41 |
| 2017-01-08 05:54:20 | -9.34 |
| 2017-01-08 05:44:20 | -9.32 |
| 2017-01-08 05:34:21 | -9.37 |
| 2017-01-08 05:24:20 | -9.47 |
| 2017-01-08 05:14:20 | -9.45 |
| 2017-01-08 05:04:20 | -9.46 |
| 2017-01-08 04:54:21 | -9.39 |
| 2017-01-08 04:44:20 | -9.48 |
| 2017-01-08 04:34:20 | -9.54 |
| 2017-01-08 04:24:20 | -9.53 |
| 2017-01-08 04:14:21 | -9.57 |
| 2017-01-08 04:04:20 | -9.55 |
| 2017-01-08 03:54:20 | -9.62 |
| 2017-01-08 03:44:20 | -9.66 |
| 2017-01-08 03:34:20 | -9.66 |
| 2017-01-08 03:24:21 | -9.66 |
| 2017-01-08 03:14:20 | -9.65 |
| 2017-01-08 03:04:20 | -9.68 |
| 2017-01-08 02:54:20 | -9.65 |
| 2017-01-08 02:44:21 | -9.67 |
| 2017-01-08 02:34:20 | -9.71 |
| 2017-01-08 02:24:20 | -9.69 |
| 2017-01-08 02:14:20 | -9.77 |
| 2017-01-08 02:04:21 | -9.77 |
| 2017-01-08 01:54:20 | -9.8 |
| 2017-01-08 01:44:20 | -9.81 |
| 2017-01-08 01:34:20 | -9.87 |
| 2017-01-08 01:24:20 | -9.82 |
| 2017-01-08 01:14:21 | -9.83 |
| 2017-01-08 01:04:20 | -9.85 |
| 2017-01-08 00:54:20 | -9.91 |
| 2017-01-08 00:44:20 | -9.94 |
| 2017-01-08 00:34:21 | -9.86 |
| 2017-01-08 00:24:20 | -9.85 |
| 2017-01-08 00:14:20 | -9.84 |
| 2017-01-08 00:04:20 | -9.84 |
| 2017-01-07 23:54:21 | -9.86 |
| 2017-01-07 23:44:20 | -9.82 |
| 2017-01-07 23:34:20 | -9.84 |
| 2017-01-07 23:24:20 | -9.97 |
| 2017-01-07 23:14:20 | -9.97 |
| 2017-01-07 23:04:21 | -9.99 |
| 2017-01-07 22:54:20 | -9.91 |
| 2017-01-07 22:44:20 | -10 |
| 2017-01-07 22:34:20 | -9.93 |
| 2017-01-07 22:24:21 | -9.94 |
| 2017-01-07 22:14:20 | -9.96 |
| 2017-01-07 22:04:20 | -9.96 |
| 2017-01-07 21:54:20 | -9.97 |
| 2017-01-07 21:44:21 | -10 |
| 2017-01-07 21:34:20 | -9.94 |
| 2017-01-07 21:24:20 | -10.03 |
| 2017-01-07 21:14:20 | -10.04 |
| 2017-01-07 21:04:20 | -10.06 |
| 2017-01-07 20:54:21 | -10.11 |
| 2017-01-07 20:44:20 | -10.06 |
| 2017-01-07 20:34:20 | -10.14 |
| 2017-01-07 20:24:20 | -10.13 |
| 2017-01-07 20:14:21 | -10.14 |
| 2017-01-07 20:04:20 | -10.15 |
| 2017-01-07 19:54:20 | -10.14 |
| 2017-01-07 19:44:20 | -10.18 |
| 2017-01-07 19:34:21 | -10.31 |
| 2017-01-07 19:24:20 | -10.26 |
| 2017-01-07 19:14:20 | -10.28 |
| 2017-01-07 19:04:20 | -10.31 |
| 2017-01-07 18:54:20 | -10.31 |
| 2017-01-07 18:44:21 | -10.34 |
| 2017-01-07 18:34:20 | -10.31 |
| 2017-01-07 18:24:20 | -10.36 |
| 2017-01-07 18:14:20 | -10.42 |
| 2017-01-07 18:04:21 | -10.43 |
| 2017-01-07 17:54:20 | -10.51 |
| 2017-01-07 17:44:20 | -10.52 |
| 2017-01-07 17:34:20 | -10.58 |
| 2017-01-07 17:24:20 | -10.52 |
| 2017-01-07 17:14:20 | -10.52 |
| 2017-01-07 17:04:20 | -10.63 |
| 2017-01-07 16:54:20 | -10.63 |
| 2017-01-07 16:44:20 | -10.54 |
| 2017-01-07 16:34:21 | -10.63 |
| 2017-01-07 16:24:20 | -10.61 |
| 2017-01-07 16:14:20 | -10.59 |
| 2017-01-07 16:04:20 | -10.67 |
| 2017-01-07 15:54:21 | -10.69 |
| 2017-01-07 15:44:20 | -10.73 |
| 2017-01-07 15:34:20 | -10.75 |
| 2017-01-07 15:24:20 | -10.8 |
| 2017-01-07 15:14:21 | -10.81 |
| 2017-01-07 15:04:20 | -10.84 |
| 2017-01-07 14:54:20 | -11.01 |
| 2017-01-07 14:44:20 | -11.13 |
| 2017-01-07 14:34:20 | -11.18 |
| 2017-01-07 14:24:21 | -11.26 |
| 2017-01-07 14:14:20 | -11.35 |
| 2017-01-07 14:04:20 | -11.39 |
| 2017-01-07 13:54:20 | -11.52 |
| 2017-01-07 13:44:21 | -11.68 |
| 2017-01-07 13:34:20 | -11.74 |
| 2017-01-07 13:24:20 | -11.99 |
| 2017-01-07 13:14:20 | -12.14 |
| 2017-01-07 13:04:21 | -12.19 |
| 2017-01-07 12:54:20 | -12.3 |
| 2017-01-07 12:44:20 | -12.53 |
| 2017-01-07 12:34:20 | -12.7 |
| 2017-01-07 12:24:20 | -12.88 |
| 2017-01-07 12:14:21 | -13.06 |
| 2017-01-07 12:04:20 | -13.19 |
| 2017-01-07 11:54:20 | -13.37 |
| 2017-01-07 11:44:20 | -13.53 |
| 2017-01-07 11:34:21 | -13.77 |
| 2017-01-07 11:24:20 | -13.99 |
| 2017-01-07 11:14:20 | -14.27 |
| 2017-01-07 11:04:20 | -14.45 |
| 2017-01-07 10:54:21 | -14.75 |
| 2017-01-07 10:44:20 | -14.87 |
| 2017-01-07 10:34:20 | -15.09 |
| 2017-01-07 10:24:20 | -15.3 |
| 2017-01-07 10:14:20 | -15.45 |
| 2017-01-07 10:04:21 | -15.57 |
| 2017-01-07 09:54:20 | -15.53 |
| 2017-01-07 09:44:20 | -15.92 |
| 2017-01-07 09:34:20 | -16.13 |
| 2017-01-07 09:24:21 | -16.17 |
| 2017-01-07 09:14:20 | -16.21 |
| 2017-01-07 09:04:20 | -16.27 |
| 2017-01-07 08:54:20 | -16.47 |
| 2017-01-07 08:44:21 | -16.65 |
| 2017-01-07 08:34:20 | -16.6 |
| 2017-01-07 08:24:20 | -16.54 |
| 2017-01-07 08:14:20 | -16.58 |
| 2017-01-07 08:04:20 | -16.63 |
| 2017-01-07 07:54:20 | -16.59 |
| 2017-01-07 07:44:20 | -16.67 |
| 2017-01-07 07:34:20 | -16.84 |
| 2017-01-07 07:24:20 | -16.82 |
| 2017-01-07 07:14:21 | -16.63 |
| 2017-01-07 07:04:20 | -16.43 |
| 2017-01-07 06:54:20 | -16.34 |
| 2017-01-07 06:44:20 | -16.35 |
| 2017-01-07 06:34:21 | -16.29 |
| 2017-01-07 06:24:20 | -16.28 |
| 2017-01-07 06:14:20 | -16.04 |
| 2017-01-07 06:04:20 | -15.9 |
| 2017-01-07 05:54:21 | -15.78 |
| 2017-01-07 05:44:20 | -15.61 |
| 2017-01-07 05:34:20 | -15.67 |
| 2017-01-07 05:24:20 | -15.54 |
| 2017-01-07 05:14:20 | -15.51 |
| 2017-01-07 05:04:21 | -15.4 |
| 2017-01-07 04:54:20 | -15.17 |
| 2017-01-07 04:44:20 | -14.9 |
| 2017-01-07 04:34:20 | -14.84 |
| 2017-01-07 04:24:21 | -14.84 |
| 2017-01-07 04:14:20 | -14.48 |
| 2017-01-07 04:04:20 | -14.36 |
| 2017-01-07 03:54:20 | -14.27 |
| 2017-01-07 03:44:21 | -14.23 |
| 2017-01-07 03:34:20 | -14.12 |
| 2017-01-07 03:24:20 | -13.94 |
| 2017-01-07 03:14:20 | -13.83 |
| 2017-01-07 03:04:20 | -13.74 |
| 2017-01-07 02:54:21 | -13.71 |
| 2017-01-07 02:44:20 | -13.8 |
| 2017-01-07 02:34:20 | -13.88 |
| 2017-01-07 02:24:20 | -13.88 |
| 2017-01-07 02:14:21 | -13.56 |
| 2017-01-07 02:04:20 | -13.41 |
| 2017-01-07 01:54:20 | -13.5 |
| 2017-01-07 01:44:20 | -13.29 |
| 2017-01-07 01:34:21 | -13.09 |
| 2017-01-07 01:24:20 | -13.08 |
| 2017-01-07 01:14:20 | -12.8 |
| 2017-01-07 01:04:20 | -12.52 |
| 2017-01-07 00:54:20 | -12.51 |
| 2017-01-07 00:44:21 | -12.56 |
| 2017-01-07 00:34:20 | -12.23 |
| 2017-01-07 00:24:20 | -11.88 |
| 2017-01-07 00:14:20 | -11.72 |
| 2017-01-07 00:04:21 | -11.43 |
| 2017-01-06 23:54:20 | -11.39 |
| 2017-01-06 23:44:20 | -11.28 |
| 2017-01-06 23:34:20 | -11.27 |
| 2017-01-06 23:24:21 | -11 |
| 2017-01-06 23:14:20 | -11 |
| 2017-01-06 23:04:20 | -10.72 |
| 2017-01-06 22:54:17 | -10.56 |
| 2017-01-06 22:44:17 | -10.55 |
| 2017-01-06 22:34:18 | -10.4 |
| 2017-01-06 22:24:17 | -10.19 |
| 2017-01-06 22:14:17 | -9.94 |
| 2017-01-06 22:04:17 | -9.67 |
| 2017-01-06 21:54:18 | -9.66 |
| 2017-01-06 21:44:17 | -9.57 |
| 2017-01-06 21:34:17 | -9.62 |
| 2017-01-06 21:24:17 | -9.26 |
| 2017-01-06 21:14:18 | -9.05 |
| 2017-01-06 21:04:17 | -8.94 |
| 2017-01-06 20:54:17 | -8.71 |
| 2017-01-06 20:44:17 | -8.7 |
| 2017-01-06 20:34:17 | -8.61 |
| 2017-01-06 20:24:18 | -8.57 |
| 2017-01-06 20:14:17 | -8.53 |
| 2017-01-06 20:04:17 | -8.57 |
| 2017-01-06 19:54:17 | -8.45 |
| 2017-01-06 19:44:18 | -8.51 |
| 2017-01-06 19:34:17 | -8.43 |
| 2017-01-06 19:24:17 | -8.34 |
| 2017-01-06 19:14:17 | -8.28 |
| 2017-01-06 19:04:18 | -8.22 |
| 2017-01-06 18:54:17 | -8.18 |
| 2017-01-06 18:44:17 | -8.14 |
| 2017-01-06 18:34:17 | -8.15 |
| 2017-01-06 18:24:17 | -8.16 |
| 2017-01-06 18:14:18 | -8.21 |
| 2017-01-06 18:04:17 | -8.21 |
| 2017-01-06 17:54:17 | -8.18 |
| 2017-01-06 17:44:17 | -8.33 |
| 2017-01-06 17:34:18 | -8.19 |
| 2017-01-06 17:24:17 | -8.15 |
| 2017-01-06 17:14:17 | -8.21 |
| 2017-01-06 17:04:17 | -8.28 |
| 2017-01-06 16:54:18 | -8.17 |
| 2017-01-06 16:44:17 | -8.26 |
| 2017-01-06 16:34:17 | -8.14 |
| 2017-01-06 16:24:17 | -8.06 |
| 2017-01-06 16:14:18 | -7.93 |
| 2017-01-06 16:04:17 | -7.91 |
| 2017-01-06 15:54:17 | -7.74 |
| 2017-01-06 15:44:17 | -7.67 |
| 2017-01-06 15:34:17 | -7.62 |
| 2017-01-06 15:24:18 | -7.62 |
| 2017-01-06 15:14:17 | -7.58 |
| 2017-01-06 15:04:17 | -7.57 |
| 2017-01-06 14:54:17 | -7.5 |
| 2017-01-06 14:44:18 | -7.47 |
| 2017-01-06 14:34:17 | -7.49 |
| 2017-01-06 14:24:17 | -7.54 |
| 2017-01-06 14:14:17 | -7.47 |
| 2017-01-06 14:04:18 | -7.48 |
| 2017-01-06 13:54:17 | -7.41 |
| 2017-01-06 13:44:17 | -7.32 |
| 2017-01-06 13:34:17 | -7.32 |
| 2017-01-06 13:24:17 | -7.35 |
| 2017-01-06 13:14:18 | -7.48 |
| 2017-01-06 13:04:17 | -7.56 |
| 2017-01-06 12:54:17 | -7.59 |
| 2017-01-06 12:44:17 | -7.62 |
| 2017-01-06 12:34:18 | -7.65 |
| 2017-01-06 12:24:17 | -7.74 |
| 2017-01-06 12:14:17 | -7.74 |
| 2017-01-06 12:04:17 | -7.93 |
| 2017-01-06 11:54:18 | -7.97 |
| 2017-01-06 11:44:17 | -7.96 |
| 2017-01-06 11:34:17 | -8.05 |
| 2017-01-06 11:24:17 | -8.03 |
| 2017-01-06 11:14:17 | -8.04 |
| 2017-01-06 11:04:18 | -7.99 |
| 2017-01-06 10:54:17 | -7.93 |
| 2017-01-06 10:44:17 | -7.93 |
| 2017-01-06 10:34:17 | -7.92 |
| 2017-01-06 10:24:18 | -7.9 |
| 2017-01-06 10:14:17 | -7.91 |
| 2017-01-06 10:04:17 | -8 |
| 2017-01-06 09:54:17 | -8.05 |
| 2017-01-06 09:44:17 | -8.24 |
| 2017-01-06 09:34:17 | -8.34 |
| 2017-01-06 09:24:17 | -8.41 |
| 2017-01-06 09:14:17 | -8.47 |
| 2017-01-06 09:04:17 | -8.45 |
| 2017-01-06 08:54:18 | -8.39 |
| 2017-01-06 08:44:17 | -8.52 |
| 2017-01-06 08:34:17 | -8.51 |
| 2017-01-06 08:24:17 | -8.56 |
| 2017-01-06 08:14:18 | -8.62 |
| 2017-01-06 08:04:17 | -8.6 |
| 2017-01-06 07:54:17 | -8.65 |
| 2017-01-06 07:44:17 | -8.65 |
| 2017-01-06 07:34:18 | -8.64 |
| 2017-01-06 07:24:17 | -8.7 |
| 2017-01-06 07:14:17 | -8.7 |
| 2017-01-06 07:04:17 | -8.65 |
| 2017-01-06 06:54:17 | -8.76 |
| 2017-01-06 06:44:18 | -8.78 |
| 2017-01-06 06:34:17 | -8.81 |
| 2017-01-06 06:24:17 | -8.81 |
| 2017-01-06 06:14:17 | -8.68 |
| 2017-01-06 06:04:18 | -8.62 |
| 2017-01-06 05:54:17 | -8.51 |
| 2017-01-06 05:44:17 | -8.5 |
| 2017-01-06 05:34:17 | -8.39 |
| 2017-01-06 05:24:18 | -8.27 |
| 2017-01-06 05:14:17 | -8.26 |
| 2017-01-06 05:04:17 | -8.12 |
| 2017-01-06 04:54:17 | -8.09 |
| 2017-01-06 04:44:17 | -8.09 |
| 2017-01-06 04:34:18 | -8.08 |
| 2017-01-06 04:24:17 | -8.09 |
| 2017-01-06 04:14:17 | -8.07 |
| 2017-01-06 04:04:17 | -8.08 |
| 2017-01-06 03:54:18 | -8.04 |
| 2017-01-06 03:44:17 | -8.11 |
| 2017-01-06 03:34:17 | -8 |
| 2017-01-06 03:24:17 | -7.97 |
| 2017-01-06 03:14:18 | -8 |
| 2017-01-06 03:04:17 | -8 |
| 2017-01-06 02:54:17 | -7.91 |
| 2017-01-06 02:44:17 | -7.85 |
| 2017-01-06 02:34:17 | -7.79 |
| 2017-01-06 02:24:18 | -7.74 |
| 2017-01-06 02:14:17 | -7.8 |
| 2017-01-06 02:04:17 | -7.7 |
| 2017-01-06 01:54:17 | -7.62 |
| 2017-01-06 01:44:18 | -7.69 |
| 2017-01-06 01:34:17 | -7.68 |
| 2017-01-06 01:24:17 | -7.62 |
| 2017-01-06 01:14:17 | -7.53 |
| 2017-01-06 01:04:17 | -7.58 |
| 2017-01-06 00:54:17 | -7.63 |
| 2017-01-06 00:44:17 | -7.56 |
| 2017-01-06 00:34:17 | -7.59 |
| 2017-01-06 00:24:17 | -7.58 |
| 2017-01-06 00:14:18 | -7.57 |
| 2017-01-06 00:04:17 | -7.58 |
| 2017-01-05 23:54:17 | -7.57 |
| 2017-01-05 23:44:17 | -7.58 |
| 2017-01-05 23:34:18 | -7.48 |
| 2017-01-05 23:24:17 | -7.5 |
| 2017-01-05 23:14:17 | -7.39 |
| 2017-01-05 23:04:17 | -7.35 |
| 2017-01-05 22:54:18 | -7.29 |
| 2017-01-05 22:44:17 | -7.24 |
| 2017-01-05 22:34:17 | -7.2 |
| 2017-01-05 22:24:17 | -7.15 |
| 2017-01-05 22:14:17 | -7.09 |
| 2017-01-05 22:04:18 | -7.08 |
| 2017-01-05 21:54:17 | -7.01 |
| 2017-01-05 21:44:17 | -7.01 |
| 2017-01-05 21:34:17 | -6.88 |
| 2017-01-05 21:24:18 | -7.03 |
| 2017-01-05 21:14:17 | -6.98 |
| 2017-01-05 21:04:17 | -6.94 |
| 2017-01-05 20:54:17 | -6.87 |
| 2017-01-05 20:44:18 | -6.89 |
| 2017-01-05 20:34:17 | -6.85 |
| 2017-01-05 20:24:17 | -6.72 |
| 2017-01-05 20:14:17 | -6.72 |
| 2017-01-05 20:04:17 | -6.69 |
| 2017-01-05 19:54:18 | -6.66 |
| 2017-01-05 19:44:17 | -6.66 |
| 2017-01-05 19:34:17 | -6.61 |
| 2017-01-05 19:24:17 | -6.66 |
| 2017-01-05 19:14:18 | -6.59 |
| 2017-01-05 19:04:17 | -6.56 |
| 2017-01-05 18:54:17 | -6.56 |
| 2017-01-05 18:44:17 | -6.52 |
| 2017-01-05 18:34:16 | -6.5 |
| 2017-01-05 18:24:15 | -6.58 |
| 2017-01-05 18:14:15 | -6.68 |
| 2017-01-05 18:04:15 | -6.71 |
| 2017-01-05 17:54:15 | -6.53 |
| 2017-01-05 17:44:16 | -6.44 |
| 2017-01-05 17:34:15 | -6.44 |
| 2017-01-05 17:24:15 | -6.36 |
| 2017-01-05 17:14:15 | -6.21 |
| 2017-01-05 17:04:16 | -6.06 |
| 2017-01-05 16:54:15 | -6 |
| 2017-01-05 16:44:15 | -5.99 |
| 2017-01-05 16:34:15 | -5.86 |
| 2017-01-05 16:24:16 | -5.9 |
| 2017-01-05 16:14:15 | -5.84 |
| 2017-01-05 16:04:15 | -5.86 |
| 2017-01-05 15:54:15 | -5.69 |
| 2017-01-05 15:44:15 | -5.62 |
| 2017-01-05 15:34:16 | -5.53 |
| 2017-01-05 15:24:15 | -5.36 |
| 2017-01-05 15:14:15 | -5.28 |
| 2017-01-05 15:04:15 | -5.15 |
| 2017-01-05 14:54:16 | -5.06 |
| 2017-01-05 14:44:15 | -4.96 |
| 2017-01-05 14:34:15 | -4.79 |
| 2017-01-05 14:24:15 | -4.65 |
| 2017-01-05 14:14:16 | -4.66 |
| 2017-01-05 14:04:15 | -4.58 |
| 2017-01-05 13:54:15 | -4.52 |
| 2017-01-05 13:44:15 | -4.24 |
| 2017-01-05 13:34:15 | -4.08 |
| 2017-01-05 13:24:16 | -4.02 |
| 2017-01-05 13:14:15 | -4.12 |
| 2017-01-05 13:04:15 | -4.12 |
| 2017-01-05 12:54:15 | -4 |
| 2017-01-05 12:44:16 | -3.98 |
| 2017-01-05 12:34:15 | -3.99 |
| 2017-01-05 12:24:15 | -3.99 |
| 2017-01-05 12:14:15 | -3.98 |
| 2017-01-05 12:04:16 | -3.9 |
| 2017-01-05 11:54:15 | -4.01 |
| 2017-01-05 11:44:15 | -4.06 |
| 2017-01-05 11:34:15 | -4.19 |
| 2017-01-05 11:24:15 | -4.25 |
| 2017-01-05 11:14:16 | -4.32 |
| 2017-01-05 11:04:15 | -4.33 |
| 2017-01-05 10:54:15 | -4.45 |
| 2017-01-05 10:44:15 | -4.39 |
| 2017-01-05 10:34:16 | -4.46 |
| 2017-01-05 10:24:15 | -4.52 |
| 2017-01-05 10:14:15 | -4.58 |
| 2017-01-05 10:04:15 | -4.54 |
| 2017-01-05 09:54:16 | -4.52 |
| 2017-01-05 09:44:15 | -4.6 |
| 2017-01-05 09:34:15 | -4.51 |
| 2017-01-05 09:24:15 | -4.51 |
| 2017-01-05 09:14:15 | -4.54 |
| 2017-01-05 09:04:16 | -4.51 |
| 2017-01-05 08:54:15 | -4.59 |
| 2017-01-05 08:44:15 | -4.54 |
| 2017-01-05 08:34:15 | -4.52 |
| 2017-01-05 08:24:16 | -4.43 |
| 2017-01-05 08:14:15 | -4.37 |
| 2017-01-05 08:04:15 | -4.34 |
| 2017-01-05 07:54:15 | -4.32 |
| 2017-01-05 07:44:16 | -4.24 |
| 2017-01-05 07:34:15 | -4.17 |
| 2017-01-05 07:24:15 | -4.25 |
| 2017-01-05 07:14:15 | -4.19 |
| 2017-01-05 07:04:15 | -4.08 |
| 2017-01-05 06:54:16 | -4 |
| 2017-01-05 06:44:15 | -4 |
| 2017-01-05 06:34:15 | -4 |
| 2017-01-05 06:24:15 | -4.02 |
| 2017-01-05 06:14:16 | -3.98 |
| 2017-01-05 06:04:15 | -3.88 |
| 2017-01-05 05:54:15 | -3.89 |
| 2017-01-05 05:44:15 | -3.84 |
| 2017-01-05 05:34:15 | -3.84 |
| 2017-01-05 05:24:16 | -3.79 |
| 2017-01-05 05:14:15 | -3.77 |
| 2017-01-05 05:04:15 | -3.7 |
| 2017-01-05 04:54:15 | -3.73 |
| 2017-01-05 04:44:16 | -3.56 |
| 2017-01-05 04:34:15 | -3.53 |
| 2017-01-05 04:24:15 | -3.47 |
| 2017-01-05 04:14:15 | -3.54 |
| 2017-01-05 04:04:16 | -3.33 |
| 2017-01-05 03:54:15 | -3.34 |
| 2017-01-05 03:44:15 | -3.25 |
| 2017-01-05 03:34:15 | -3.19 |
| 2017-01-05 03:24:15 | -3.17 |
| 2017-01-05 03:14:15 | -3.05 |
| 2017-01-05 03:04:15 | -2.97 |
| 2017-01-05 02:54:15 | -2.88 |
| 2017-01-05 02:44:15 | -2.68 |
| 2017-01-05 02:34:16 | -2.54 |
| 2017-01-05 02:24:15 | -2.36 |
| 2017-01-05 02:14:15 | -2.25 |
| 2017-01-05 02:04:15 | -2.16 |
| 2017-01-05 01:54:16 | -2.1 |
| 2017-01-05 01:44:15 | -2.07 |
| 2017-01-05 01:34:15 | -2.02 |
| 2017-01-05 01:24:15 | -1.98 |
| 2017-01-05 01:14:16 | -1.99 |
| 2017-01-05 01:04:15 | -1.97 |
| 2017-01-05 00:54:15 | -1.92 |
| 2017-01-05 00:44:15 | -1.95 |
| 2017-01-05 00:34:15 | -1.95 |
| 2017-01-05 00:24:16 | -1.85 |
| 2017-01-05 00:14:15 | -1.87 |
| 2017-01-05 00:04:15 | -1.86 |
| 2017-01-04 23:54:15 | -1.88 |
| 2017-01-04 23:44:16 | -1.85 |
| 2017-01-04 23:34:15 | -1.88 |
| 2017-01-04 23:24:15 | -1.88 |
| 2017-01-04 23:14:15 | -1.79 |
| 2017-01-04 23:04:16 | -1.66 |
| 2017-01-04 22:54:15 | -1.48 |
| 2017-01-04 22:44:15 | -1.42 |
| 2017-01-04 22:34:15 | -1.4 |
| 2017-01-04 22:24:15 | -1.36 |
| 2017-01-04 22:14:16 | -1.2 |
| 2017-01-04 22:04:15 | -1.19 |
| 2017-01-04 21:54:15 | -1.16 |
| 2017-01-04 21:44:15 | -1.17 |
| 2017-01-04 21:34:16 | -1.13 |
| 2017-01-04 21:24:15 | -1.1 |
| 2017-01-04 21:14:15 | -1.09 |
| 2017-01-04 21:04:15 | -1.09 |
| 2017-01-04 20:54:16 | -1.14 |
| 2017-01-04 20:44:15 | -1.09 |
| 2017-01-04 20:34:15 | -1.02 |
| 2017-01-04 20:24:15 | -0.84 |
| 2017-01-04 20:14:15 | -0.75 |
| 2017-01-04 20:04:16 | -0.75 |
| 2017-01-04 19:54:15 | -0.7 |
| 2017-01-04 19:44:15 | -0.62 |
| 2017-01-04 19:34:15 | -0.61 |
| 2017-01-04 19:24:16 | -0.57 |
| 2017-01-04 19:14:15 | -0.61 |
| 2017-01-04 19:04:15 | -0.59 |
| 2017-01-04 18:54:15 | -0.57 |
| 2017-01-04 18:44:16 | -0.48 |
| 2017-01-04 18:34:15 | -0.46 |
| 2017-01-04 18:24:15 | -0.44 |
| 2017-01-04 18:14:15 | -0.44 |
| 2017-01-04 18:04:15 | -0.5 |
| 2017-01-04 17:54:16 | -0.46 |
| 2017-01-04 17:44:15 | -0.47 |
| 2017-01-04 17:34:15 | -0.6 |
| 2017-01-04 17:24:15 | -0.49 |
| 2017-01-04 17:14:16 | -0.44 |
| 2017-01-04 17:04:15 | -0.32 |
| 2017-01-04 16:54:15 | -0.36 |
| 2017-01-04 16:44:15 | -0.19 |
| 2017-01-04 16:34:15 | -0.06 |
| 2017-01-04 16:24:16 | -0.05 |
| 2017-01-04 16:14:15 | -0.05 |
| 2017-01-04 16:04:15 | 0.04 |
| 2017-01-04 15:54:15 | 0.02 |
| 2017-01-04 15:44:16 | -0.01 |
| 2017-01-04 15:34:15 | -0.02 |
| 2017-01-04 15:24:15 | 0 |
| 2017-01-04 15:14:15 | 0.05 |
| 2017-01-04 15:04:16 | 0.06 |
| 2017-01-04 14:54:15 | 0.01 |
| 2017-01-04 14:44:15 | -0.02 |
| 2017-01-04 14:34:15 | -0.04 |
| 2017-01-04 14:24:16 | -0.04 |
| 2017-01-04 14:14:15 | -0.06 |
| 2017-01-04 14:04:15 | -0.12 |
| 2017-01-04 13:54:15 | -0.1 |
| 2017-01-04 13:44:15 | -0.09 |
| 2017-01-04 13:34:16 | -0.12 |
| 2017-01-04 13:24:15 | -0.04 |
| 2017-01-04 13:14:15 | -0.08 |
| 2017-01-04 13:04:15 | -0.1 |
| 2017-01-04 12:54:16 | -0.07 |
| 2017-01-04 12:44:15 | -0.1 |
| 2017-01-04 12:34:15 | -0.1 |
| 2017-01-04 12:24:15 | -0.18 |
| 2017-01-04 12:14:16 | -0.24 |
| 2017-01-04 12:04:15 | -0.19 |
| 2017-01-04 11:54:15 | -0.22 |
| 2017-01-04 11:44:15 | -0.31 |
| 2017-01-04 11:34:15 | -0.28 |
| 2017-01-04 11:24:16 | -0.32 |
| 2017-01-04 11:14:15 | -0.36 |
| 2017-01-04 11:04:15 | -0.4 |
| 2017-01-04 10:54:15 | -0.45 |
| 2017-01-04 10:44:16 | -0.47 |
| 2017-01-04 10:34:15 | -0.52 |
| 2017-01-04 10:24:15 | -0.54 |
| 2017-01-04 10:14:15 | -0.55 |
| 2017-01-04 10:04:15 | -0.65 |
| 2017-01-04 09:54:15 | -0.59 |
| 2017-01-04 09:44:15 | -0.59 |
| 2017-01-04 09:34:15 | -0.64 |
| 2017-01-04 09:24:12 | -0.63 |
| 2017-01-04 09:14:13 | -0.69 |
| 2017-01-04 09:04:12 | -0.76 |
| 2017-01-04 08:54:12 | -0.69 |
| 2017-01-04 08:44:12 | -0.75 |
| 2017-01-04 08:34:13 | -0.73 |
| 2017-01-04 08:24:12 | -0.73 |
| 2017-01-04 08:14:12 | -0.79 |
| 2017-01-04 08:04:12 | -0.76 |
| 2017-01-04 07:54:12 | -0.9 |
| 2017-01-04 07:44:12 | -0.86 |
| 2017-01-04 07:34:12 | -0.9 |
| 2017-01-04 07:24:12 | -0.89 |
| 2017-01-04 07:14:12 | -0.88 |
| 2017-01-04 07:04:13 | -0.95 |
| 2017-01-04 06:54:12 | -0.93 |
| 2017-01-04 06:44:12 | -1.02 |
| 2017-01-04 06:34:12 | -0.94 |
| 2017-01-04 06:24:13 | -0.94 |
| 2017-01-04 06:14:12 | -0.98 |
| 2017-01-04 06:04:12 | -0.99 |
| 2017-01-04 05:54:12 | -0.96 |
| 2017-01-04 05:44:12 | -1.04 |
| 2017-01-04 05:34:12 | -0.97 |
| 2017-01-04 05:24:12 | -1.01 |
| 2017-01-04 05:14:12 | -0.97 |
| 2017-01-04 05:04:12 | -0.94 |
| 2017-01-04 04:54:13 | -1.02 |
| 2017-01-04 04:44:12 | -1.05 |
| 2017-01-04 04:34:12 | -0.96 |
| 2017-01-04 04:24:12 | -1.01 |
| 2017-01-04 04:14:13 | -0.95 |
| 2017-01-04 04:04:12 | -1.01 |
| 2017-01-04 03:54:12 | -0.97 |
| 2017-01-04 03:44:12 | -1.05 |
| 2017-01-04 03:34:13 | -1.04 |
| 2017-01-04 03:24:12 | -1.04 |
| 2017-01-04 03:14:12 | -1.07 |
| 2017-01-04 03:04:12 | -0.98 |
| 2017-01-04 02:54:12 | -1.05 |
| 2017-01-04 02:44:13 | -1.08 |
| 2017-01-04 02:34:12 | -1.05 |
| 2017-01-04 02:24:12 | -1.12 |
| 2017-01-04 02:14:12 | -1.09 |
| 2017-01-04 02:04:13 | -1.1 |
| 2017-01-04 01:54:12 | -1.13 |
| 2017-01-04 01:44:12 | -1.08 |
| 2017-01-04 01:34:12 | -1.18 |
| 2017-01-04 01:24:13 | -1.13 |
| 2017-01-04 01:14:12 | -1.13 |
| 2017-01-04 01:04:12 | -1.1 |
| 2017-01-04 00:54:12 | -1.21 |
| 2017-01-04 00:44:12 | -1.17 |
| 2017-01-04 00:34:13 | -1.14 |
| 2017-01-04 00:24:12 | -1.13 |
| 2017-01-04 00:14:12 | -1.1 |
| 2017-01-04 00:04:12 | -1.08 |
| 2017-01-03 23:54:13 | -1.13 |
| 2017-01-03 23:44:12 | -1.13 |
| 2017-01-03 23:34:12 | -1.09 |
| 2017-01-03 23:24:12 | -1.16 |
| 2017-01-03 23:14:13 | -1.12 |
| 2017-01-03 23:04:12 | -1.1 |
| 2017-01-03 22:54:12 | -1.12 |
| 2017-01-03 22:44:12 | -1.12 |
| 2017-01-03 22:34:12 | -1.03 |
| 2017-01-03 22:24:13 | -1.04 |
| 2017-01-03 22:14:12 | -0.98 |
| 2017-01-03 22:04:12 | -0.96 |
| 2017-01-03 21:54:12 | -0.94 |
| 2017-01-03 21:44:13 | -0.9 |
| 2017-01-03 21:34:12 | -0.84 |
| 2017-01-03 21:24:12 | -0.83 |
| 2017-01-03 21:14:12 | -0.8 |
| 2017-01-03 21:04:13 | -0.82 |
| 2017-01-03 20:54:12 | -0.81 |
| 2017-01-03 20:44:12 | -0.84 |
| 2017-01-03 20:34:12 | -0.68 |
| 2017-01-03 20:24:12 | -0.83 |
| 2017-01-03 20:14:13 | -0.77 |
| 2017-01-03 20:04:12 | -0.78 |
| 2017-01-03 19:54:12 | -0.69 |
| 2017-01-03 19:44:12 | -0.72 |
| 2017-01-03 19:34:13 | -0.79 |
| 2017-01-03 19:24:12 | -0.73 |
| 2017-01-03 19:14:12 | -0.7 |
| 2017-01-03 19:04:12 | -0.7 |
| 2017-01-03 18:54:13 | -0.69 |
| 2017-01-03 18:44:12 | -0.75 |
| 2017-01-03 18:34:12 | -0.73 |
| 2017-01-03 18:24:12 | -0.84 |
| 2017-01-03 18:14:12 | -0.82 |
| 2017-01-03 18:04:13 | -0.82 |
| 2017-01-03 17:54:12 | -0.8 |
| 2017-01-03 17:44:12 | -0.83 |
| 2017-01-03 17:34:12 | -0.9 |
| 2017-01-03 17:24:13 | -0.88 |
| 2017-01-03 17:14:12 | -0.95 |
| 2017-01-03 17:04:12 | -0.88 |
| 2017-01-03 16:54:12 | -0.88 |
| 2017-01-03 16:44:13 | -0.97 |
| 2017-01-03 16:34:12 | -0.87 |
| 2017-01-03 16:24:12 | -0.98 |
| 2017-01-03 16:14:12 | -0.92 |
| 2017-01-03 16:04:12 | -0.95 |
| 2017-01-03 15:54:13 | -0.93 |
| 2017-01-03 15:44:12 | -0.87 |
| 2017-01-03 15:34:12 | -0.94 |
| 2017-01-03 15:24:12 | -0.88 |
| 2017-01-03 15:14:13 | -0.89 |
| 2017-01-03 15:04:12 | -0.89 |
| 2017-01-03 14:54:12 | -0.83 |
| 2017-01-03 14:44:12 | -0.87 |
| 2017-01-03 14:34:12 | -0.8 |
| 2017-01-03 14:24:12 | -0.87 |
| 2017-01-03 14:14:12 | -0.76 |
| 2017-01-03 14:04:12 | -0.82 |
| 2017-01-03 13:54:12 | -0.82 |
| 2017-01-03 13:44:13 | -0.83 |
| 2017-01-03 13:34:12 | -0.89 |
| 2017-01-03 13:24:12 | -0.92 |
| 2017-01-03 13:14:12 | -0.99 |
| 2017-01-03 13:04:13 | -1.01 |
| 2017-01-03 12:54:12 | -1.12 |
| 2017-01-03 12:44:12 | -1.19 |
| 2017-01-03 12:34:12 | -1.22 |
| 2017-01-03 12:24:13 | -1.35 |
| 2017-01-03 12:14:12 | -1.4 |
| 2017-01-03 12:04:12 | -1.43 |
| 2017-01-03 11:54:12 | -1.54 |
| 2017-01-03 11:44:12 | -1.66 |
| 2017-01-03 11:34:13 | -1.81 |
| 2017-01-03 11:24:12 | -1.85 |
| 2017-01-03 11:14:12 | -2.01 |
| 2017-01-03 11:04:12 | -2.11 |
| 2017-01-03 10:54:13 | -2.21 |
| 2017-01-03 10:44:12 | -2.41 |
| 2017-01-03 10:34:12 | -2.5 |
| 2017-01-03 10:24:12 | -2.65 |
| 2017-01-03 10:14:12 | -2.82 |
| 2017-01-03 10:04:12 | -2.88 |
| 2017-01-03 09:54:12 | -2.99 |
| 2017-01-03 09:44:12 | -3.14 |
| 2017-01-03 09:34:12 | -3.23 |
| 2017-01-03 09:24:13 | -3.33 |
| 2017-01-03 09:14:12 | -3.34 |
| 2017-01-03 09:04:12 | -3.44 |
| 2017-01-03 08:54:12 | -3.56 |
| 2017-01-03 08:44:13 | -3.48 |
| 2017-01-03 08:34:12 | -3.58 |
| 2017-01-03 08:24:12 | -3.62 |
| 2017-01-03 08:14:12 | -3.63 |
| 2017-01-03 08:04:13 | -3.69 |
| 2017-01-03 07:54:12 | -3.77 |
| 2017-01-03 07:44:12 | -3.8 |
| 2017-01-03 07:34:12 | -3.76 |
| 2017-01-03 07:24:12 | -3.76 |
| 2017-01-03 07:14:13 | -3.78 |
| 2017-01-03 07:04:12 | -3.71 |
| 2017-01-03 06:54:12 | -3.76 |
| 2017-01-03 06:44:12 | -3.74 |
| 2017-01-03 06:34:13 | -3.7 |
| 2017-01-03 06:24:12 | -3.72 |
| 2017-01-03 06:14:12 | -3.7 |
| 2017-01-03 06:04:12 | -3.72 |
| 2017-01-03 05:54:13 | -3.67 |
| 2017-01-03 05:44:12 | -3.6 |
| 2017-01-03 05:34:12 | -3.53 |
| 2017-01-03 05:24:12 | -3.53 |
| 2017-01-03 05:14:12 | -3.45 |
| 2017-01-03 05:04:13 | -3.48 |
| 2017-01-03 04:54:12 | -3.41 |
| 2017-01-03 04:44:12 | -3.4 |
| 2017-01-03 04:34:12 | -3.34 |
| 2017-01-03 04:24:13 | -3.35 |
| 2017-01-03 04:14:12 | -3.33 |
| 2017-01-03 04:04:12 | -3.29 |
| 2017-01-03 03:54:12 | -3.43 |
| 2017-01-03 03:44:12 | -3.38 |
| 2017-01-03 03:34:13 | -3.44 |
| 2017-01-03 03:24:12 | -3.45 |
| 2017-01-03 03:14:12 | -3.5 |
| 2017-01-03 03:04:12 | -3.42 |
| 2017-01-03 02:54:13 | -3.38 |
| 2017-01-03 02:44:12 | -3.47 |
| 2017-01-03 02:34:12 | -3.5 |
| 2017-01-03 02:24:12 | -3.39 |
| 2017-01-03 02:14:13 | -3.33 |
| 2017-01-03 02:04:12 | -3.43 |
| 2017-01-03 01:54:12 | -3.67 |
| 2017-01-03 01:44:12 | -3.67 |
| 2017-01-03 01:34:12 | -3.54 |
| 2017-01-03 01:24:13 | -3.43 |
| 2017-01-03 01:14:12 | -3.18 |
| 2017-01-03 01:04:12 | -2.99 |
| 2017-01-03 00:54:12 | -2.85 |
| 2017-01-03 00:44:13 | -2.62 |
| 2017-01-03 00:34:12 | -2.51 |
| 2017-01-03 00:24:12 | -2.42 |
| 2017-01-03 00:14:12 | -2.38 |
| 2017-01-03 00:04:13 | -2.22 |
| 2017-01-02 23:54:12 | -2.13 |
| 2017-01-02 23:44:12 | -2.1 |
| 2017-01-02 23:34:12 | -2.06 |
| 2017-01-02 23:24:12 | -1.93 |
| 2017-01-02 23:14:13 | -1.99 |
| 2017-01-02 23:04:12 | -2.02 |
| 2017-01-02 22:54:12 | -2.03 |
| 2017-01-02 22:44:12 | -2.03 |
| 2017-01-02 22:34:13 | -1.95 |
| 2017-01-02 22:24:12 | -1.96 |
| 2017-01-02 22:14:12 | -1.87 |
| 2017-01-02 22:04:12 | -1.83 |
| 2017-01-02 21:54:13 | -1.84 |
| 2017-01-02 21:44:12 | -1.8 |
| 2017-01-02 21:34:12 | -1.87 |
| 2017-01-02 21:24:12 | -1.9 |
| 2017-01-02 21:14:12 | -1.86 |
| 2017-01-02 21:04:13 | -1.86 |
| 2017-01-02 20:54:12 | -1.88 |
| 2017-01-02 20:44:10 | -1.91 |
| 2017-01-02 20:34:10 | -1.95 |
| 2017-01-02 20:24:11 | -1.97 |
| 2017-01-02 20:14:10 | -1.99 |
| 2017-01-02 20:04:10 | -1.97 |
| 2017-01-02 19:54:10 | -2.03 |
| 2017-01-02 19:44:11 | -2.13 |
| 2017-01-02 19:34:10 | -2.13 |
| 2017-01-02 19:24:10 | -2.17 |
| 2017-01-02 19:14:10 | -2.08 |
| 2017-01-02 19:04:10 | -2.13 |
| 2017-01-02 18:54:11 | -2.1 |
| 2017-01-02 18:44:10 | -2.17 |
| 2017-01-02 18:34:10 | -2.23 |
| 2017-01-02 18:24:10 | -2.3 |
| 2017-01-02 18:14:11 | -2.37 |
| 2017-01-02 18:04:10 | -2.39 |
| 2017-01-02 17:54:10 | -2.49 |
| 2017-01-02 17:44:10 | -2.62 |
| 2017-01-02 17:34:10 | -2.6 |
| 2017-01-02 17:24:10 | -2.76 |
| 2017-01-02 17:14:10 | -2.85 |
| 2017-01-02 17:04:10 | -2.96 |
| 2017-01-02 16:54:10 | -3.15 |
| 2017-01-02 16:44:11 | -3.14 |
| 2017-01-02 16:34:10 | -3.2 |
| 2017-01-02 16:24:10 | -3.31 |
| 2017-01-02 16:14:10 | -3.32 |
| 2017-01-02 16:04:11 | -3.44 |
| 2017-01-02 15:54:10 | -3.54 |
| 2017-01-02 15:44:10 | -3.68 |
| 2017-01-02 15:34:10 | -3.76 |
| 2017-01-02 15:24:11 | -3.84 |
| 2017-01-02 15:14:10 | -3.77 |
| 2017-01-02 15:04:10 | -3.76 |
| 2017-01-02 14:54:10 | -3.76 |
| 2017-01-02 14:44:10 | -3.84 |
| 2017-01-02 14:34:11 | -3.87 |
| 2017-01-02 14:24:10 | -3.95 |
| 2017-01-02 14:14:10 | -3.95 |
| 2017-01-02 14:04:10 | -3.95 |
| 2017-01-02 13:54:11 | -4.02 |
| 2017-01-02 13:44:10 | -4.1 |
| 2017-01-02 13:34:10 | -4.17 |
| 2017-01-02 13:24:10 | -4.24 |
| 2017-01-02 13:14:11 | -4.28 |
| 2017-01-02 13:04:10 | -4.41 |
| 2017-01-02 12:54:10 | -4.62 |
| 2017-01-02 12:44:10 | -4.66 |
| 2017-01-02 12:34:10 | -4.76 |
| 2017-01-02 12:24:11 | -4.8 |
| 2017-01-02 12:14:10 | -4.89 |
| 2017-01-02 12:04:10 | -4.98 |
| 2017-01-02 11:54:10 | -4.99 |
| 2017-01-02 11:44:11 | -5.12 |
| 2017-01-02 11:34:10 | -5.19 |
| 2017-01-02 11:24:10 | -5.24 |
| 2017-01-02 11:14:10 | -5.32 |
| 2017-01-02 11:04:11 | -5.39 |
| 2017-01-02 10:54:10 | -5.38 |
| 2017-01-02 10:44:10 | -5.46 |
| 2017-01-02 10:34:10 | -5.47 |
| 2017-01-02 10:24:10 | -5.6 |
| 2017-01-02 10:14:11 | -5.68 |
| 2017-01-02 10:04:10 | -5.71 |
| 2017-01-02 09:54:10 | -5.77 |
| 2017-01-02 09:44:10 | -5.92 |
| 2017-01-02 09:34:11 | -6 |
| 2017-01-02 09:24:10 | -6.06 |
| 2017-01-02 09:14:10 | -6.31 |
| 2017-01-02 09:04:10 | -6.55 |
| 2017-01-02 08:54:11 | -6.87 |
| 2017-01-02 08:44:10 | -6.94 |
| 2017-01-02 08:34:10 | -7.12 |
| 2017-01-02 08:24:10 | -7.16 |
| 2017-01-02 08:14:10 | -7.29 |
| 2017-01-02 08:04:11 | -7.42 |
| 2017-01-02 07:54:10 | -7.46 |
| 2017-01-02 07:44:10 | -7.56 |
| 2017-01-02 07:34:10 | -7.5 |
| 2017-01-02 07:24:11 | -7.64 |
| 2017-01-02 07:14:10 | -7.79 |
| 2017-01-02 07:04:10 | -7.96 |
| 2017-01-02 06:54:10 | -8.11 |
| 2017-01-02 06:44:11 | -8.27 |
| 2017-01-02 06:34:10 | -8.36 |
| 2017-01-02 06:24:10 | -8.53 |
| 2017-01-02 06:14:10 | -8.61 |
| 2017-01-02 06:04:10 | -8.76 |
| 2017-01-02 05:54:11 | -8.96 |
| 2017-01-02 05:44:10 | -8.97 |
| 2017-01-02 05:34:10 | -9.18 |
| 2017-01-02 05:24:10 | -9.34 |
| 2017-01-02 05:14:11 | -9.46 |
| 2017-01-02 05:04:10 | -9.62 |
| 2017-01-02 04:54:10 | -9.78 |
| 2017-01-02 04:44:10 | -9.96 |
| 2017-01-02 04:34:11 | -10.12 |
| 2017-01-02 04:24:10 | -10.33 |
| 2017-01-02 04:14:10 | -10.45 |
| 2017-01-02 04:04:10 | -10.52 |
| 2017-01-02 03:54:10 | -10.54 |
| 2017-01-02 03:44:11 | -10.5 |
| 2017-01-02 03:34:10 | -10.45 |
| 2017-01-02 03:24:10 | -10.53 |
| 2017-01-02 03:14:10 | -10.52 |
| 2017-01-02 03:04:11 | -10.5 |
| 2017-01-02 02:54:10 | -10.33 |
| 2017-01-02 02:44:10 | -10.38 |
| 2017-01-02 02:34:10 | -10.26 |
| 2017-01-02 02:24:11 | -10.21 |
| 2017-01-02 02:14:10 | -10.16 |
| 2017-01-02 02:04:10 | -10.19 |
| 2017-01-02 01:54:10 | -10.04 |
| 2017-01-02 01:44:10 | -10.01 |
| 2017-01-02 01:34:11 | -10.06 |
| 2017-01-02 01:24:10 | -9.98 |
| 2017-01-02 01:14:10 | -9.89 |
| 2017-01-02 01:04:10 | -9.91 |
| 2017-01-02 00:54:11 | -9.82 |
| 2017-01-02 00:44:10 | -9.78 |
| 2017-01-02 00:34:10 | -9.72 |
| 2017-01-02 00:24:10 | -9.71 |
| 2017-01-02 00:14:11 | -9.7 |
| 2017-01-02 00:04:10 | -9.6 |
| 2017-01-01 23:54:10 | -9.65 |
| 2017-01-01 23:44:10 | -9.57 |
| 2017-01-01 23:34:10 | -9.41 |
| 2017-01-01 23:24:11 | -9.39 |
| 2017-01-01 23:14:10 | -9.35 |
| 2017-01-01 23:04:10 | -9.35 |
| 2017-01-01 22:54:10 | -9.26 |
| 2017-01-01 22:44:11 | -9.27 |
| 2017-01-01 22:34:10 | -9.21 |
| 2017-01-01 22:24:10 | -9.18 |
| 2017-01-01 22:14:10 | -9.04 |
| 2017-01-01 22:04:11 | -9.06 |
| 2017-01-01 21:54:10 | -9.06 |
| 2017-01-01 21:44:10 | -9.03 |
| 2017-01-01 21:34:10 | -9.01 |
| 2017-01-01 21:24:10 | -9.07 |
| 2017-01-01 21:14:11 | -9.05 |
| 2017-01-01 21:04:10 | -8.98 |
| 2017-01-01 20:54:10 | -8.89 |
| 2017-01-01 20:44:10 | -8.91 |
| 2017-01-01 20:34:09 | -8.94 |
| 2017-01-01 20:24:08 | -8.86 |
| 2017-01-01 20:14:08 | -8.77 |
| 2017-01-01 20:04:08 | -8.83 |
| 2017-01-01 19:54:09 | -8.78 |
| 2017-01-01 19:44:08 | -8.72 |
| 2017-01-01 19:34:08 | -8.63 |
| 2017-01-01 19:24:08 | -8.7 |
| 2017-01-01 19:14:08 | -8.56 |
| 2017-01-01 19:04:09 | -8.51 |
| 2017-01-01 18:54:08 | -8.53 |
| 2017-01-01 18:44:08 | -8.5 |
| 2017-01-01 18:34:08 | -8.46 |
| 2017-01-01 18:24:09 | -8.38 |
| 2017-01-01 18:14:08 | -8.35 |
| 2017-01-01 18:04:08 | -8.19 |
| 2017-01-01 17:54:08 | -8.18 |
| 2017-01-01 17:44:09 | -8.14 |
| 2017-01-01 17:34:08 | -8.08 |
| 2017-01-01 17:24:08 | -8 |
| 2017-01-01 17:14:08 | -7.98 |
| 2017-01-01 17:04:08 | -7.78 |
| 2017-01-01 16:54:09 | -7.71 |
| 2017-01-01 16:44:08 | -7.72 |
| 2017-01-01 16:34:08 | -7.61 |
| 2017-01-01 16:24:08 | -7.48 |
| 2017-01-01 16:14:09 | -7.4 |
| 2017-01-01 16:04:08 | -7.28 |
| 2017-01-01 15:54:08 | -7.26 |
| 2017-01-01 15:44:08 | -7.16 |
| 2017-01-01 15:34:08 | -7.01 |
| 2017-01-01 15:24:08 | -7 |
| 2017-01-01 15:14:08 | -6.97 |
| 2017-01-01 15:04:08 | -6.86 |
| 2017-01-01 14:54:08 | -6.74 |
| 2017-01-01 14:44:09 | -6.79 |
| 2017-01-01 14:34:08 | -6.78 |
| 2017-01-01 14:24:08 | -6.75 |
| 2017-01-01 14:14:08 | -6.75 |
| 2017-01-01 14:04:09 | -6.86 |
| 2017-01-01 13:54:08 | -6.93 |
| 2017-01-01 13:44:08 | -6.98 |
| 2017-01-01 13:34:08 | -7.12 |
| 2017-01-01 13:24:08 | -7.2 |
| 2017-01-01 13:14:08 | -7.27 |
| 2017-01-01 13:04:08 | -7.33 |
| 2017-01-01 12:54:08 | -7.47 |
| 2017-01-01 12:44:08 | -7.55 |
| 2017-01-01 12:34:09 | -7.76 |
| 2017-01-01 12:24:08 | -7.91 |
| 2017-01-01 12:14:08 | -8.03 |
| 2017-01-01 12:04:08 | -8.11 |
| 2017-01-01 11:54:09 | -8.21 |
| 2017-01-01 11:44:08 | -8.35 |
| 2017-01-01 11:34:08 | -8.42 |
| 2017-01-01 11:24:08 | -8.51 |
| 2017-01-01 11:14:08 | -8.5 |
| 2017-01-01 11:04:08 | -8.47 |
| 2017-01-01 10:54:08 | -8.49 |
| 2017-01-01 10:44:08 | -8.56 |
| 2017-01-01 10:34:08 | -8.57 |
| 2017-01-01 10:24:09 | -8.7 |
| 2017-01-01 10:14:08 | -8.85 |
| 2017-01-01 10:04:08 | -8.95 |
| 2017-01-01 09:54:08 | -9.1 |
| 2017-01-01 09:44:09 | -9.31 |
| 2017-01-01 09:34:08 | -9.46 |
| 2017-01-01 09:24:08 | -9.66 |
| 2017-01-01 09:14:08 | -9.78 |
| 2017-01-01 09:04:09 | -9.91 |
| 2017-01-01 08:54:08 | -9.81 |
| 2017-01-01 08:44:08 | -9.77 |
| 2017-01-01 08:34:08 | -9.64 |
| 2017-01-01 08:24:08 | -9.62 |
| 2017-01-01 08:14:09 | -9.42 |
| 2017-01-01 08:04:08 | -9.27 |
| 2017-01-01 07:54:08 | -9.16 |
| 2017-01-01 07:44:08 | -8.87 |
| 2017-01-01 07:34:09 | -8.73 |
| 2017-01-01 07:24:08 | -8.52 |
| 2017-01-01 07:14:08 | -8.43 |
| 2017-01-01 07:04:08 | -8.47 |
| 2017-01-01 06:54:09 | -8.48 |
| 2017-01-01 06:44:08 | -8.26 |
| 2017-01-01 06:34:08 | -8.3 |
| 2017-01-01 06:24:08 | -8.33 |
| 2017-01-01 06:14:08 | -8.33 |
| 2017-01-01 06:04:09 | -8.31 |
| 2017-01-01 05:54:08 | -8.23 |
| 2017-01-01 05:44:08 | -8.14 |
| 2017-01-01 05:34:08 | -8.11 |
| 2017-01-01 05:24:09 | -8.19 |
| 2017-01-01 05:14:08 | -8.14 |
| 2017-01-01 05:04:08 | -8.08 |
| 2017-01-01 04:54:08 | -8.04 |
| 2017-01-01 04:44:08 | -7.98 |
| 2017-01-01 04:34:09 | -8.03 |
| 2017-01-01 04:24:08 | -7.99 |
| 2017-01-01 04:14:08 | -7.97 |
| 2017-01-01 04:04:08 | -7.94 |
| 2017-01-01 03:54:09 | -7.92 |
| 2017-01-01 03:44:08 | -7.79 |
| 2017-01-01 03:34:08 | -7.79 |
| 2017-01-01 03:24:08 | -7.87 |
| 2017-01-01 03:14:09 | -7.73 |
| 2017-01-01 03:04:08 | -7.7 |
| 2017-01-01 02:54:08 | -7.7 |
| 2017-01-01 02:44:08 | -7.64 |
| 2017-01-01 02:34:09 | -7.67 |
| 2017-01-01 02:24:08 | -7.55 |
| 2017-01-01 02:14:08 | -7.47 |
| 2017-01-01 02:04:08 | -7.5 |
| 2017-01-01 01:54:08 | -7.55 |
| 2017-01-01 01:44:09 | -7.56 |
| 2017-01-01 01:34:08 | -7.58 |
| 2017-01-01 01:24:08 | -7.59 |
| 2017-01-01 01:14:08 | -7.55 |
| 2017-01-01 01:04:09 | -7.57 |
| 2017-01-01 00:54:08 | -7.53 |
| 2017-01-01 00:44:08 | -7.4 |
| 2017-01-01 00:34:08 | -7.31 |
| 2017-01-01 00:24:09 | -7.18 |
| 2017-01-01 00:14:08 | -7.11 |
| 2017-01-01 00:04:08 | -7.03 |